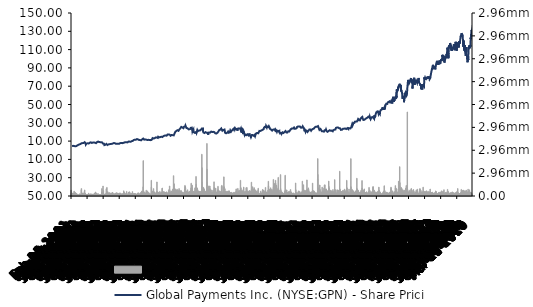
| Category | Global Payments Inc. (NYSE:GPN) - Volume |
|---|---|
| 2001-01-26 | 82000 |
| 2001-01-29 | 262000 |
| 2001-01-30 | 339200 |
| 2001-01-31 | 326000 |
| 2001-02-01 | 2556800 |
| 2001-02-02 | 795600 |
| 2001-02-05 | 644800 |
| 2001-02-06 | 1338800 |
| 2001-02-07 | 1350400 |
| 2001-02-08 | 578800 |
| 2001-02-09 | 441600 |
| 2001-02-12 | 327200 |
| 2001-02-13 | 648800 |
| 2001-02-14 | 135600 |
| 2001-02-15 | 454400 |
| 2001-02-16 | 427200 |
| 2001-02-20 | 1000400 |
| 2001-02-21 | 443600 |
| 2001-02-22 | 623600 |
| 2001-02-23 | 1222800 |
| 2001-02-26 | 1182400 |
| 2001-02-27 | 690000 |
| 2001-02-28 | 326000 |
| 2001-03-01 | 155200 |
| 2001-03-02 | 836800 |
| 2001-03-05 | 402800 |
| 2001-03-06 | 610000 |
| 2001-03-07 | 89600 |
| 2001-03-08 | 211600 |
| 2001-03-09 | 269600 |
| 2001-03-12 | 106400 |
| 2001-03-13 | 671600 |
| 2001-03-14 | 455600 |
| 2001-03-15 | 1160400 |
| 2001-03-16 | 402800 |
| 2001-03-19 | 1173600 |
| 2001-03-20 | 222000 |
| 2001-03-21 | 135200 |
| 2001-03-22 | 2125600 |
| 2001-03-23 | 757600 |
| 2001-03-26 | 207600 |
| 2001-03-27 | 435200 |
| 2001-03-28 | 420800 |
| 2001-03-29 | 535200 |
| 2001-03-30 | 1308800 |
| 2001-04-02 | 685600 |
| 2001-04-03 | 192800 |
| 2001-04-04 | 606000 |
| 2001-04-05 | 629200 |
| 2001-04-06 | 476000 |
| 2001-04-09 | 113600 |
| 2001-04-10 | 954400 |
| 2001-04-11 | 1570000 |
| 2001-04-12 | 689200 |
| 2001-04-16 | 368000 |
| 2001-04-17 | 581200 |
| 2001-04-18 | 285200 |
| 2001-04-19 | 121600 |
| 2001-04-20 | 1139600 |
| 2001-04-23 | 946400 |
| 2001-04-24 | 626000 |
| 2001-04-25 | 326000 |
| 2001-04-26 | 469200 |
| 2001-04-27 | 550800 |
| 2001-04-30 | 946800 |
| 2001-05-01 | 889200 |
| 2001-05-02 | 547600 |
| 2001-05-03 | 289200 |
| 2001-05-04 | 521600 |
| 2001-05-07 | 176400 |
| 2001-05-08 | 920000 |
| 2001-05-09 | 213200 |
| 2001-05-10 | 161600 |
| 2001-05-11 | 71600 |
| 2001-05-14 | 136400 |
| 2001-05-15 | 244800 |
| 2001-05-16 | 309600 |
| 2001-05-17 | 278800 |
| 2001-05-18 | 119600 |
| 2001-05-21 | 113600 |
| 2001-05-22 | 606800 |
| 2001-05-23 | 323200 |
| 2001-05-24 | 375200 |
| 2001-05-25 | 251600 |
| 2001-05-29 | 271200 |
| 2001-05-30 | 334000 |
| 2001-05-31 | 350400 |
| 2001-06-01 | 77200 |
| 2001-06-04 | 92800 |
| 2001-06-05 | 513600 |
| 2001-06-06 | 279200 |
| 2001-06-07 | 400000 |
| 2001-06-08 | 111600 |
| 2001-06-11 | 267200 |
| 2001-06-12 | 351600 |
| 2001-06-13 | 111600 |
| 2001-06-14 | 155600 |
| 2001-06-15 | 436000 |
| 2001-06-18 | 177600 |
| 2001-06-19 | 145200 |
| 2001-06-20 | 306400 |
| 2001-06-21 | 946400 |
| 2001-06-22 | 276800 |
| 2001-06-25 | 233600 |
| 2001-06-26 | 731200 |
| 2001-06-27 | 396400 |
| 2001-06-28 | 433600 |
| 2001-06-29 | 523200 |
| 2001-07-02 | 410000 |
| 2001-07-03 | 197200 |
| 2001-07-05 | 460400 |
| 2001-07-06 | 181200 |
| 2001-07-09 | 556400 |
| 2001-07-10 | 346800 |
| 2001-07-11 | 250800 |
| 2001-07-12 | 349600 |
| 2001-07-13 | 151200 |
| 2001-07-16 | 93200 |
| 2001-07-17 | 190000 |
| 2001-07-18 | 139200 |
| 2001-07-19 | 2679600 |
| 2001-07-20 | 3266800 |
| 2001-07-23 | 1524000 |
| 2001-07-24 | 934800 |
| 2001-07-25 | 184800 |
| 2001-07-26 | 294000 |
| 2001-07-27 | 732000 |
| 2001-07-30 | 501200 |
| 2001-07-31 | 347200 |
| 2001-08-01 | 368400 |
| 2001-08-02 | 421200 |
| 2001-08-03 | 507600 |
| 2001-08-06 | 564800 |
| 2001-08-07 | 190400 |
| 2001-08-08 | 264800 |
| 2001-08-09 | 348400 |
| 2001-08-10 | 366400 |
| 2001-08-13 | 1308000 |
| 2001-08-14 | 746000 |
| 2001-08-15 | 1166000 |
| 2001-08-16 | 306800 |
| 2001-08-17 | 667600 |
| 2001-08-20 | 315200 |
| 2001-08-21 | 638800 |
| 2001-08-22 | 309200 |
| 2001-08-23 | 356800 |
| 2001-08-24 | 189200 |
| 2001-08-27 | 161200 |
| 2001-08-28 | 242000 |
| 2001-08-29 | 306000 |
| 2001-08-30 | 229600 |
| 2001-08-31 | 451600 |
| 2001-09-04 | 513600 |
| 2001-09-05 | 286400 |
| 2001-09-06 | 1967200 |
| 2001-09-07 | 1041200 |
| 2001-09-10 | 315600 |
| 2001-09-17 | 782400 |
| 2001-09-18 | 2638400 |
| 2001-09-19 | 559600 |
| 2001-09-20 | 423600 |
| 2001-09-21 | 972000 |
| 2001-09-24 | 926400 |
| 2001-09-25 | 1120400 |
| 2001-09-26 | 1187600 |
| 2001-09-27 | 281600 |
| 2001-09-28 | 975600 |
| 2001-10-01 | 441200 |
| 2001-10-02 | 298400 |
| 2001-10-03 | 298000 |
| 2001-10-04 | 559200 |
| 2001-10-05 | 409200 |
| 2001-10-08 | 155200 |
| 2001-10-09 | 444400 |
| 2001-10-10 | 288000 |
| 2001-10-11 | 255200 |
| 2001-10-12 | 170400 |
| 2001-10-15 | 240800 |
| 2001-10-16 | 638800 |
| 2001-10-17 | 334000 |
| 2001-10-18 | 349600 |
| 2001-10-19 | 266800 |
| 2001-10-22 | 294800 |
| 2001-10-23 | 224400 |
| 2001-10-24 | 141600 |
| 2001-10-25 | 349600 |
| 2001-10-26 | 185200 |
| 2001-10-29 | 514000 |
| 2001-10-30 | 482400 |
| 2001-10-31 | 409200 |
| 2001-11-01 | 482000 |
| 2001-11-02 | 235200 |
| 2001-11-05 | 353600 |
| 2001-11-06 | 316800 |
| 2001-11-07 | 226400 |
| 2001-11-08 | 315600 |
| 2001-11-09 | 408400 |
| 2001-11-12 | 149200 |
| 2001-11-13 | 478400 |
| 2001-11-14 | 132800 |
| 2001-11-15 | 233600 |
| 2001-11-16 | 390800 |
| 2001-11-19 | 818000 |
| 2001-11-20 | 1246800 |
| 2001-11-21 | 261600 |
| 2001-11-23 | 232400 |
| 2001-11-26 | 735200 |
| 2001-11-27 | 364400 |
| 2001-11-28 | 364400 |
| 2001-11-29 | 284800 |
| 2001-11-30 | 615600 |
| 2001-12-03 | 518800 |
| 2001-12-04 | 513200 |
| 2001-12-05 | 633200 |
| 2001-12-06 | 385200 |
| 2001-12-07 | 426000 |
| 2001-12-10 | 789600 |
| 2001-12-11 | 571200 |
| 2001-12-12 | 290400 |
| 2001-12-13 | 366400 |
| 2001-12-14 | 476000 |
| 2001-12-17 | 581200 |
| 2001-12-18 | 821600 |
| 2001-12-19 | 614400 |
| 2001-12-20 | 366400 |
| 2001-12-21 | 932800 |
| 2001-12-24 | 76800 |
| 2001-12-26 | 328400 |
| 2001-12-27 | 609600 |
| 2001-12-28 | 439200 |
| 2001-12-31 | 327200 |
| 2002-01-02 | 439600 |
| 2002-01-03 | 582800 |
| 2002-01-04 | 672000 |
| 2002-01-07 | 330000 |
| 2002-01-08 | 318800 |
| 2002-01-09 | 304800 |
| 2002-01-10 | 904800 |
| 2002-01-11 | 272000 |
| 2002-01-14 | 222400 |
| 2002-01-15 | 203600 |
| 2002-01-16 | 337600 |
| 2002-01-17 | 503200 |
| 2002-01-18 | 336800 |
| 2002-01-22 | 227200 |
| 2002-01-23 | 337200 |
| 2002-01-24 | 282400 |
| 2002-01-25 | 310800 |
| 2002-01-28 | 338400 |
| 2002-01-29 | 825600 |
| 2002-01-30 | 470400 |
| 2002-01-31 | 602000 |
| 2002-02-01 | 534400 |
| 2002-02-04 | 392000 |
| 2002-02-05 | 181600 |
| 2002-02-06 | 301600 |
| 2002-02-07 | 318800 |
| 2002-02-08 | 315200 |
| 2002-02-11 | 361600 |
| 2002-02-12 | 376000 |
| 2002-02-13 | 806400 |
| 2002-02-14 | 242400 |
| 2002-02-15 | 738000 |
| 2002-02-19 | 412400 |
| 2002-02-20 | 525200 |
| 2002-02-21 | 324800 |
| 2002-02-22 | 466400 |
| 2002-02-25 | 435200 |
| 2002-02-26 | 142400 |
| 2002-02-27 | 377600 |
| 2002-02-28 | 1262000 |
| 2002-03-01 | 442800 |
| 2002-03-04 | 606000 |
| 2002-03-05 | 545600 |
| 2002-03-06 | 408400 |
| 2002-03-07 | 588800 |
| 2002-03-08 | 1193200 |
| 2002-03-11 | 718000 |
| 2002-03-12 | 404000 |
| 2002-03-13 | 210400 |
| 2002-03-14 | 222400 |
| 2002-03-15 | 414000 |
| 2002-03-18 | 1752000 |
| 2002-03-19 | 643200 |
| 2002-03-20 | 1170800 |
| 2002-03-21 | 1375600 |
| 2002-03-22 | 1010400 |
| 2002-03-25 | 538400 |
| 2002-03-26 | 622800 |
| 2002-03-27 | 474800 |
| 2002-03-28 | 435600 |
| 2002-04-01 | 359200 |
| 2002-04-02 | 332400 |
| 2002-04-03 | 273200 |
| 2002-04-04 | 1028800 |
| 2002-04-05 | 530000 |
| 2002-04-08 | 689200 |
| 2002-04-09 | 435200 |
| 2002-04-10 | 478400 |
| 2002-04-11 | 900000 |
| 2002-04-12 | 754400 |
| 2002-04-15 | 620400 |
| 2002-04-16 | 537600 |
| 2002-04-17 | 314800 |
| 2002-04-18 | 915200 |
| 2002-04-19 | 199600 |
| 2002-04-22 | 274800 |
| 2002-04-23 | 280800 |
| 2002-04-24 | 315200 |
| 2002-04-25 | 343600 |
| 2002-04-26 | 359200 |
| 2002-04-29 | 374000 |
| 2002-04-30 | 1017200 |
| 2002-05-01 | 481200 |
| 2002-05-02 | 360800 |
| 2002-05-03 | 533200 |
| 2002-05-06 | 272400 |
| 2002-05-07 | 300800 |
| 2002-05-08 | 431600 |
| 2002-05-09 | 518400 |
| 2002-05-10 | 284400 |
| 2002-05-13 | 276800 |
| 2002-05-14 | 458400 |
| 2002-05-15 | 403600 |
| 2002-05-16 | 260400 |
| 2002-05-17 | 335200 |
| 2002-05-20 | 420800 |
| 2002-05-21 | 490000 |
| 2002-05-22 | 528400 |
| 2002-05-23 | 446000 |
| 2002-05-24 | 311600 |
| 2002-05-28 | 219600 |
| 2002-05-29 | 276400 |
| 2002-05-30 | 340400 |
| 2002-05-31 | 457200 |
| 2002-06-03 | 592400 |
| 2002-06-04 | 649600 |
| 2002-06-05 | 618400 |
| 2002-06-06 | 615600 |
| 2002-06-07 | 508400 |
| 2002-06-10 | 332400 |
| 2002-06-11 | 243600 |
| 2002-06-12 | 512000 |
| 2002-06-13 | 424800 |
| 2002-06-14 | 466800 |
| 2002-06-17 | 512800 |
| 2002-06-18 | 396800 |
| 2002-06-19 | 484800 |
| 2002-06-20 | 353600 |
| 2002-06-21 | 748800 |
| 2002-06-24 | 852800 |
| 2002-06-25 | 1016000 |
| 2002-06-26 | 1466400 |
| 2002-06-27 | 1668400 |
| 2002-06-28 | 3239600 |
| 2002-07-01 | 996800 |
| 2002-07-02 | 726000 |
| 2002-07-03 | 312800 |
| 2002-07-05 | 115600 |
| 2002-07-08 | 423600 |
| 2002-07-09 | 955600 |
| 2002-07-10 | 522800 |
| 2002-07-11 | 791600 |
| 2002-07-12 | 535600 |
| 2002-07-15 | 779600 |
| 2002-07-16 | 677200 |
| 2002-07-17 | 937200 |
| 2002-07-18 | 4363600 |
| 2002-07-19 | 1128400 |
| 2002-07-22 | 1453200 |
| 2002-07-23 | 1330000 |
| 2002-07-24 | 740800 |
| 2002-07-25 | 2378400 |
| 2002-07-26 | 605600 |
| 2002-07-29 | 355600 |
| 2002-07-30 | 794000 |
| 2002-07-31 | 737200 |
| 2002-08-01 | 409600 |
| 2002-08-02 | 336800 |
| 2002-08-05 | 250000 |
| 2002-08-06 | 571600 |
| 2002-08-07 | 833200 |
| 2002-08-08 | 437200 |
| 2002-08-09 | 534800 |
| 2002-08-12 | 706000 |
| 2002-08-13 | 466800 |
| 2002-08-14 | 411200 |
| 2002-08-15 | 273200 |
| 2002-08-16 | 583600 |
| 2002-08-19 | 586800 |
| 2002-08-20 | 574400 |
| 2002-08-21 | 564400 |
| 2002-08-22 | 340000 |
| 2002-08-23 | 339200 |
| 2002-08-26 | 236000 |
| 2002-08-27 | 452800 |
| 2002-08-28 | 336400 |
| 2002-08-29 | 480400 |
| 2002-08-30 | 299200 |
| 2002-09-03 | 230800 |
| 2002-09-04 | 435200 |
| 2002-09-05 | 600400 |
| 2002-09-06 | 350800 |
| 2002-09-09 | 1310800 |
| 2002-09-10 | 3163200 |
| 2002-09-11 | 888000 |
| 2002-09-12 | 658400 |
| 2002-09-13 | 1352400 |
| 2002-09-16 | 1165200 |
| 2002-09-17 | 1048000 |
| 2002-09-18 | 608000 |
| 2002-09-19 | 3760400 |
| 2002-09-20 | 1194800 |
| 2002-09-23 | 822800 |
| 2002-09-24 | 674800 |
| 2002-09-25 | 437200 |
| 2002-09-26 | 576400 |
| 2002-09-27 | 800000 |
| 2002-09-30 | 670000 |
| 2002-10-01 | 1747200 |
| 2002-10-02 | 1017200 |
| 2002-10-03 | 1875200 |
| 2002-10-04 | 1268800 |
| 2002-10-07 | 623200 |
| 2002-10-08 | 790800 |
| 2002-10-09 | 475200 |
| 2002-10-10 | 775200 |
| 2002-10-11 | 676400 |
| 2002-10-14 | 398000 |
| 2002-10-15 | 783200 |
| 2002-10-16 | 1066000 |
| 2002-10-17 | 1315600 |
| 2002-10-18 | 527200 |
| 2002-10-21 | 453600 |
| 2002-10-22 | 496400 |
| 2002-10-23 | 700800 |
| 2002-10-24 | 530800 |
| 2002-10-25 | 310800 |
| 2002-10-28 | 194800 |
| 2002-10-29 | 1215600 |
| 2002-10-30 | 636800 |
| 2002-10-31 | 794000 |
| 2002-11-01 | 763200 |
| 2002-11-04 | 1488400 |
| 2002-11-05 | 410400 |
| 2002-11-06 | 746800 |
| 2002-11-07 | 352400 |
| 2002-11-08 | 540800 |
| 2002-11-11 | 634800 |
| 2002-11-12 | 667200 |
| 2002-11-13 | 1162000 |
| 2002-11-14 | 558400 |
| 2002-11-15 | 448800 |
| 2002-11-18 | 409200 |
| 2002-11-19 | 525600 |
| 2002-11-20 | 757600 |
| 2002-11-21 | 679200 |
| 2002-11-22 | 303600 |
| 2002-11-25 | 484000 |
| 2002-11-26 | 389200 |
| 2002-11-27 | 604800 |
| 2002-11-29 | 96000 |
| 2002-12-02 | 286000 |
| 2002-12-03 | 467600 |
| 2002-12-04 | 1338400 |
| 2002-12-05 | 354800 |
| 2002-12-06 | 476400 |
| 2002-12-09 | 424800 |
| 2002-12-10 | 740000 |
| 2002-12-11 | 274800 |
| 2002-12-12 | 817200 |
| 2002-12-13 | 530800 |
| 2002-12-16 | 523600 |
| 2002-12-17 | 357200 |
| 2002-12-18 | 923600 |
| 2002-12-19 | 1518000 |
| 2002-12-20 | 1540400 |
| 2002-12-23 | 706000 |
| 2002-12-24 | 262800 |
| 2002-12-26 | 313600 |
| 2002-12-27 | 301200 |
| 2002-12-30 | 630400 |
| 2002-12-31 | 653600 |
| 2003-01-02 | 1044000 |
| 2003-01-03 | 428800 |
| 2003-01-06 | 841600 |
| 2003-01-07 | 479600 |
| 2003-01-08 | 322000 |
| 2003-01-09 | 501600 |
| 2003-01-10 | 667200 |
| 2003-01-13 | 466800 |
| 2003-01-14 | 374400 |
| 2003-01-15 | 542400 |
| 2003-01-16 | 407200 |
| 2003-01-17 | 370800 |
| 2003-01-21 | 306400 |
| 2003-01-22 | 544000 |
| 2003-01-23 | 1068000 |
| 2003-01-24 | 505200 |
| 2003-01-27 | 602800 |
| 2003-01-28 | 631600 |
| 2003-01-29 | 638400 |
| 2003-01-30 | 311200 |
| 2003-01-31 | 449200 |
| 2003-02-03 | 280800 |
| 2003-02-04 | 698800 |
| 2003-02-05 | 550800 |
| 2003-02-06 | 388000 |
| 2003-02-07 | 400800 |
| 2003-02-10 | 413600 |
| 2003-02-11 | 485200 |
| 2003-02-12 | 480800 |
| 2003-02-13 | 1259200 |
| 2003-02-14 | 710400 |
| 2003-02-18 | 224000 |
| 2003-02-19 | 286800 |
| 2003-02-20 | 282000 |
| 2003-02-21 | 226800 |
| 2003-02-24 | 384000 |
| 2003-02-25 | 800000 |
| 2003-02-26 | 281200 |
| 2003-02-27 | 1477200 |
| 2003-02-28 | 333600 |
| 2003-03-03 | 746000 |
| 2003-03-04 | 287200 |
| 2003-03-05 | 273600 |
| 2003-03-06 | 264000 |
| 2003-03-07 | 624000 |
| 2003-03-10 | 586800 |
| 2003-03-11 | 227600 |
| 2003-03-12 | 846800 |
| 2003-03-13 | 634800 |
| 2003-03-14 | 379200 |
| 2003-03-17 | 1266000 |
| 2003-03-18 | 1115600 |
| 2003-03-19 | 283600 |
| 2003-03-20 | 1016000 |
| 2003-03-21 | 1146000 |
| 2003-03-24 | 528000 |
| 2003-03-25 | 410000 |
| 2003-03-26 | 1011200 |
| 2003-03-27 | 374800 |
| 2003-03-28 | 490000 |
| 2003-03-31 | 504800 |
| 2003-04-01 | 714800 |
| 2003-04-02 | 646000 |
| 2003-04-03 | 540400 |
| 2003-04-04 | 410400 |
| 2003-04-07 | 646000 |
| 2003-04-08 | 443200 |
| 2003-04-09 | 533200 |
| 2003-04-10 | 911200 |
| 2003-04-11 | 690000 |
| 2003-04-14 | 715200 |
| 2003-04-15 | 1262000 |
| 2003-04-16 | 813200 |
| 2003-04-17 | 366000 |
| 2003-04-21 | 624800 |
| 2003-04-22 | 698000 |
| 2003-04-23 | 592000 |
| 2003-04-24 | 472400 |
| 2003-04-25 | 1356000 |
| 2003-04-28 | 503200 |
| 2003-04-29 | 642800 |
| 2003-04-30 | 508000 |
| 2003-05-01 | 865600 |
| 2003-05-02 | 960000 |
| 2003-05-05 | 576000 |
| 2003-05-06 | 498000 |
| 2003-05-07 | 582000 |
| 2003-05-08 | 636000 |
| 2003-05-09 | 312400 |
| 2003-05-12 | 830800 |
| 2003-05-13 | 321600 |
| 2003-05-14 | 231200 |
| 2003-05-15 | 363200 |
| 2003-05-16 | 666800 |
| 2003-05-19 | 448000 |
| 2003-05-20 | 412800 |
| 2003-05-21 | 404000 |
| 2003-05-22 | 475600 |
| 2003-05-23 | 121600 |
| 2003-05-27 | 982400 |
| 2003-05-28 | 304000 |
| 2003-05-29 | 755600 |
| 2003-05-30 | 1051200 |
| 2003-06-02 | 596000 |
| 2003-06-03 | 481600 |
| 2003-06-04 | 254400 |
| 2003-06-05 | 462800 |
| 2003-06-06 | 725600 |
| 2003-06-09 | 361600 |
| 2003-06-10 | 324000 |
| 2003-06-11 | 175200 |
| 2003-06-12 | 256400 |
| 2003-06-13 | 334800 |
| 2003-06-16 | 373600 |
| 2003-06-17 | 352000 |
| 2003-06-18 | 252000 |
| 2003-06-19 | 357200 |
| 2003-06-20 | 325200 |
| 2003-06-23 | 1045200 |
| 2003-06-24 | 696800 |
| 2003-06-25 | 2260400 |
| 2003-06-26 | 651600 |
| 2003-06-27 | 699200 |
| 2003-06-30 | 1491600 |
| 2003-07-01 | 744800 |
| 2003-07-02 | 706400 |
| 2003-07-03 | 409600 |
| 2003-07-07 | 552000 |
| 2003-07-08 | 1586800 |
| 2003-07-09 | 398000 |
| 2003-07-10 | 256000 |
| 2003-07-11 | 409200 |
| 2003-07-14 | 647600 |
| 2003-07-15 | 722000 |
| 2003-07-16 | 1041200 |
| 2003-07-17 | 546800 |
| 2003-07-18 | 1064800 |
| 2003-07-21 | 397200 |
| 2003-07-22 | 446000 |
| 2003-07-23 | 296400 |
| 2003-07-24 | 275200 |
| 2003-07-25 | 318000 |
| 2003-07-28 | 245600 |
| 2003-07-29 | 281600 |
| 2003-07-30 | 393600 |
| 2003-07-31 | 261600 |
| 2003-08-01 | 333200 |
| 2003-08-04 | 345600 |
| 2003-08-05 | 475200 |
| 2003-08-06 | 182400 |
| 2003-08-07 | 153600 |
| 2003-08-08 | 212400 |
| 2003-08-11 | 203200 |
| 2003-08-12 | 2005600 |
| 2003-08-13 | 1357200 |
| 2003-08-14 | 584000 |
| 2003-08-15 | 596000 |
| 2003-08-18 | 427200 |
| 2003-08-19 | 448400 |
| 2003-08-20 | 424400 |
| 2003-08-21 | 324000 |
| 2003-08-22 | 300800 |
| 2003-08-25 | 134000 |
| 2003-08-26 | 294000 |
| 2003-08-27 | 130400 |
| 2003-08-28 | 254400 |
| 2003-08-29 | 262000 |
| 2003-09-02 | 485200 |
| 2003-09-03 | 303600 |
| 2003-09-04 | 360800 |
| 2003-09-05 | 474400 |
| 2003-09-08 | 880400 |
| 2003-09-09 | 813600 |
| 2003-09-10 | 1025200 |
| 2003-09-11 | 1328400 |
| 2003-09-12 | 856800 |
| 2003-09-15 | 372800 |
| 2003-09-16 | 783600 |
| 2003-09-17 | 1488000 |
| 2003-09-18 | 1647600 |
| 2003-09-19 | 619600 |
| 2003-09-22 | 591600 |
| 2003-09-23 | 902800 |
| 2003-09-24 | 1244000 |
| 2003-09-25 | 1846400 |
| 2003-09-26 | 952000 |
| 2003-09-29 | 1072800 |
| 2003-09-30 | 792400 |
| 2003-10-01 | 1611200 |
| 2003-10-02 | 1391200 |
| 2003-10-03 | 548800 |
| 2003-10-06 | 800400 |
| 2003-10-07 | 486800 |
| 2003-10-08 | 491200 |
| 2003-10-09 | 671600 |
| 2003-10-10 | 253200 |
| 2003-10-13 | 273200 |
| 2003-10-14 | 492800 |
| 2003-10-15 | 452000 |
| 2003-10-16 | 505200 |
| 2003-10-17 | 802800 |
| 2003-10-20 | 538000 |
| 2003-10-21 | 514400 |
| 2003-10-22 | 664000 |
| 2003-10-23 | 1059200 |
| 2003-10-24 | 1073200 |
| 2003-10-27 | 491200 |
| 2003-10-28 | 654800 |
| 2003-10-29 | 743200 |
| 2003-10-30 | 746000 |
| 2003-10-31 | 648800 |
| 2003-11-03 | 621584 |
| 2003-11-04 | 502320 |
| 2003-11-05 | 474400 |
| 2003-11-06 | 682400 |
| 2003-11-07 | 344400 |
| 2003-11-10 | 641600 |
| 2003-11-11 | 287600 |
| 2003-11-12 | 517200 |
| 2003-11-13 | 1940000 |
| 2003-11-14 | 1002800 |
| 2003-11-17 | 609600 |
| 2003-11-18 | 440800 |
| 2003-11-19 | 1303600 |
| 2003-11-20 | 1207600 |
| 2003-11-21 | 424800 |
| 2003-11-24 | 648000 |
| 2003-11-25 | 555200 |
| 2003-11-26 | 480400 |
| 2003-11-28 | 325600 |
| 2003-12-01 | 358000 |
| 2003-12-02 | 670000 |
| 2003-12-03 | 488400 |
| 2003-12-04 | 636400 |
| 2003-12-05 | 340000 |
| 2003-12-08 | 342400 |
| 2003-12-09 | 612800 |
| 2003-12-10 | 627600 |
| 2003-12-11 | 753200 |
| 2003-12-12 | 1082800 |
| 2003-12-15 | 603200 |
| 2003-12-16 | 712000 |
| 2003-12-17 | 762800 |
| 2003-12-18 | 527200 |
| 2003-12-19 | 822400 |
| 2003-12-22 | 858000 |
| 2003-12-23 | 999200 |
| 2003-12-24 | 166000 |
| 2003-12-26 | 162000 |
| 2003-12-29 | 667200 |
| 2003-12-30 | 676400 |
| 2003-12-31 | 343200 |
| 2004-01-02 | 988800 |
| 2004-01-05 | 806000 |
| 2004-01-06 | 974800 |
| 2004-01-07 | 352000 |
| 2004-01-08 | 274800 |
| 2004-01-09 | 573200 |
| 2004-01-12 | 562000 |
| 2004-01-13 | 457600 |
| 2004-01-14 | 706000 |
| 2004-01-15 | 500000 |
| 2004-01-16 | 540800 |
| 2004-01-20 | 785600 |
| 2004-01-21 | 702000 |
| 2004-01-22 | 671200 |
| 2004-01-23 | 413200 |
| 2004-01-26 | 311600 |
| 2004-01-27 | 376400 |
| 2004-01-28 | 494800 |
| 2004-01-29 | 848400 |
| 2004-01-30 | 743600 |
| 2004-02-02 | 746400 |
| 2004-02-03 | 665600 |
| 2004-02-04 | 679600 |
| 2004-02-05 | 561600 |
| 2004-02-06 | 463200 |
| 2004-02-09 | 674000 |
| 2004-02-10 | 591200 |
| 2004-02-11 | 1275200 |
| 2004-02-12 | 874000 |
| 2004-02-13 | 739200 |
| 2004-02-17 | 1178400 |
| 2004-02-18 | 876400 |
| 2004-02-19 | 816400 |
| 2004-02-20 | 1288000 |
| 2004-02-23 | 1356800 |
| 2004-02-24 | 778400 |
| 2004-02-25 | 420000 |
| 2004-02-26 | 743200 |
| 2004-02-27 | 617600 |
| 2004-03-01 | 699600 |
| 2004-03-02 | 695600 |
| 2004-03-03 | 542800 |
| 2004-03-04 | 558800 |
| 2004-03-05 | 489200 |
| 2004-03-08 | 644000 |
| 2004-03-09 | 408800 |
| 2004-03-10 | 378800 |
| 2004-03-11 | 533200 |
| 2004-03-12 | 383600 |
| 2004-03-15 | 531200 |
| 2004-03-16 | 721200 |
| 2004-03-17 | 461200 |
| 2004-03-18 | 1183600 |
| 2004-03-19 | 586000 |
| 2004-03-22 | 616000 |
| 2004-03-23 | 582000 |
| 2004-03-24 | 993600 |
| 2004-03-25 | 711600 |
| 2004-03-26 | 388400 |
| 2004-03-29 | 360400 |
| 2004-03-30 | 632000 |
| 2004-03-31 | 938400 |
| 2004-04-01 | 795200 |
| 2004-04-02 | 1511200 |
| 2004-04-05 | 668800 |
| 2004-04-06 | 378800 |
| 2004-04-07 | 752800 |
| 2004-04-08 | 773200 |
| 2004-04-12 | 458400 |
| 2004-04-13 | 1560800 |
| 2004-04-14 | 854400 |
| 2004-04-15 | 1852400 |
| 2004-04-16 | 1755200 |
| 2004-04-19 | 2155600 |
| 2004-04-20 | 1188000 |
| 2004-04-21 | 568400 |
| 2004-04-22 | 1177600 |
| 2004-04-23 | 919200 |
| 2004-04-26 | 696000 |
| 2004-04-27 | 680800 |
| 2004-04-28 | 470000 |
| 2004-04-29 | 662400 |
| 2004-04-30 | 487600 |
| 2004-05-03 | 613200 |
| 2004-05-04 | 800000 |
| 2004-05-05 | 2048000 |
| 2004-05-06 | 1278000 |
| 2004-05-07 | 1456800 |
| 2004-05-10 | 996800 |
| 2004-05-11 | 4020000 |
| 2004-05-12 | 15467200 |
| 2004-05-13 | 2550800 |
| 2004-05-14 | 2379600 |
| 2004-05-17 | 1096400 |
| 2004-05-18 | 1387200 |
| 2004-05-19 | 2032800 |
| 2004-05-20 | 840400 |
| 2004-05-21 | 944000 |
| 2004-05-24 | 717200 |
| 2004-05-25 | 853600 |
| 2004-05-26 | 1147600 |
| 2004-05-27 | 548400 |
| 2004-05-28 | 370800 |
| 2004-06-01 | 694000 |
| 2004-06-02 | 710000 |
| 2004-06-03 | 1614000 |
| 2004-06-04 | 428000 |
| 2004-06-07 | 604800 |
| 2004-06-08 | 511200 |
| 2004-06-09 | 842400 |
| 2004-06-10 | 612000 |
| 2004-06-14 | 916800 |
| 2004-06-15 | 742400 |
| 2004-06-16 | 762000 |
| 2004-06-17 | 367200 |
| 2004-06-18 | 389600 |
| 2004-06-21 | 711200 |
| 2004-06-22 | 1080400 |
| 2004-06-23 | 908400 |
| 2004-06-24 | 1238400 |
| 2004-06-25 | 1194800 |
| 2004-06-28 | 624800 |
| 2004-06-29 | 1141600 |
| 2004-06-30 | 1207200 |
| 2004-07-01 | 2515200 |
| 2004-07-02 | 945600 |
| 2004-07-06 | 1128800 |
| 2004-07-07 | 1592800 |
| 2004-07-08 | 1594800 |
| 2004-07-09 | 1134800 |
| 2004-07-12 | 1017200 |
| 2004-07-13 | 934800 |
| 2004-07-14 | 1037200 |
| 2004-07-15 | 752800 |
| 2004-07-16 | 1337200 |
| 2004-07-19 | 1712400 |
| 2004-07-20 | 794000 |
| 2004-07-21 | 1534000 |
| 2004-07-22 | 2222800 |
| 2004-07-23 | 1085200 |
| 2004-07-26 | 1012400 |
| 2004-07-27 | 1188800 |
| 2004-07-28 | 488400 |
| 2004-07-29 | 598000 |
| 2004-07-30 | 623600 |
| 2004-08-02 | 626000 |
| 2004-08-03 | 753600 |
| 2004-08-04 | 858000 |
| 2004-08-05 | 545200 |
| 2004-08-06 | 1085600 |
| 2004-08-09 | 555200 |
| 2004-08-10 | 668800 |
| 2004-08-11 | 1603600 |
| 2004-08-12 | 1161200 |
| 2004-08-13 | 1048000 |
| 2004-08-16 | 376800 |
| 2004-08-17 | 584400 |
| 2004-08-18 | 811600 |
| 2004-08-19 | 903600 |
| 2004-08-20 | 452800 |
| 2004-08-23 | 623600 |
| 2004-08-24 | 505200 |
| 2004-08-25 | 598800 |
| 2004-08-26 | 499200 |
| 2004-08-27 | 456800 |
| 2004-08-30 | 424800 |
| 2004-08-31 | 903200 |
| 2004-09-01 | 662800 |
| 2004-09-02 | 739200 |
| 2004-09-03 | 497600 |
| 2004-09-07 | 517200 |
| 2004-09-08 | 524400 |
| 2004-09-09 | 672000 |
| 2004-09-10 | 355200 |
| 2004-09-13 | 340400 |
| 2004-09-14 | 526400 |
| 2004-09-15 | 582000 |
| 2004-09-16 | 281200 |
| 2004-09-17 | 343200 |
| 2004-09-20 | 425600 |
| 2004-09-21 | 854400 |
| 2004-09-22 | 934000 |
| 2004-09-23 | 6858400 |
| 2004-09-24 | 3878000 |
| 2004-09-27 | 1092800 |
| 2004-09-28 | 1106000 |
| 2004-09-29 | 1455600 |
| 2004-09-30 | 1502000 |
| 2004-10-01 | 1899600 |
| 2004-10-04 | 1332000 |
| 2004-10-05 | 850400 |
| 2004-10-06 | 689600 |
| 2004-10-07 | 754400 |
| 2004-10-08 | 845600 |
| 2004-10-11 | 1076400 |
| 2004-10-12 | 1371200 |
| 2004-10-13 | 2194000 |
| 2004-10-14 | 1449600 |
| 2004-10-15 | 992800 |
| 2004-10-18 | 1194400 |
| 2004-10-19 | 1498800 |
| 2004-10-20 | 664400 |
| 2004-10-21 | 1792000 |
| 2004-10-22 | 1458000 |
| 2004-10-25 | 1008000 |
| 2004-10-26 | 922000 |
| 2004-10-27 | 1612000 |
| 2004-10-28 | 3244400 |
| 2004-10-29 | 994800 |
| 2004-11-01 | 1645600 |
| 2004-11-02 | 1892400 |
| 2004-11-03 | 1679600 |
| 2004-11-04 | 1052000 |
| 2004-11-05 | 964000 |
| 2004-11-08 | 1243600 |
| 2004-11-09 | 1049600 |
| 2004-11-10 | 1282400 |
| 2004-11-11 | 559600 |
| 2004-11-12 | 897200 |
| 2004-11-15 | 1212000 |
| 2004-11-16 | 576400 |
| 2004-11-17 | 1777600 |
| 2004-11-18 | 712800 |
| 2004-11-19 | 564800 |
| 2004-11-22 | 831200 |
| 2004-11-23 | 780400 |
| 2004-11-24 | 556000 |
| 2004-11-26 | 177200 |
| 2004-11-29 | 830800 |
| 2004-11-30 | 1040800 |
| 2004-12-01 | 715200 |
| 2004-12-02 | 630800 |
| 2004-12-03 | 830000 |
| 2004-12-06 | 830400 |
| 2004-12-07 | 754800 |
| 2004-12-08 | 576000 |
| 2004-12-09 | 565200 |
| 2004-12-10 | 456800 |
| 2004-12-13 | 890000 |
| 2004-12-14 | 584400 |
| 2004-12-15 | 742400 |
| 2004-12-16 | 1693600 |
| 2004-12-17 | 1496000 |
| 2004-12-20 | 662400 |
| 2004-12-21 | 1062000 |
| 2004-12-22 | 1733200 |
| 2004-12-23 | 6143200 |
| 2004-12-27 | 2107600 |
| 2004-12-28 | 1097600 |
| 2004-12-29 | 903600 |
| 2004-12-30 | 576800 |
| 2004-12-31 | 1107600 |
| 2005-01-03 | 1226400 |
| 2005-01-04 | 1289600 |
| 2005-01-05 | 1205600 |
| 2005-01-06 | 1575600 |
| 2005-01-07 | 1587600 |
| 2005-01-10 | 741600 |
| 2005-01-11 | 1088800 |
| 2005-01-12 | 1209200 |
| 2005-01-13 | 1632800 |
| 2005-01-14 | 470400 |
| 2005-01-18 | 609600 |
| 2005-01-19 | 559600 |
| 2005-01-20 | 886400 |
| 2005-01-21 | 598400 |
| 2005-01-24 | 862000 |
| 2005-01-25 | 658800 |
| 2005-01-26 | 680000 |
| 2005-01-27 | 1440800 |
| 2005-01-28 | 759600 |
| 2005-01-31 | 889600 |
| 2005-02-01 | 606000 |
| 2005-02-02 | 594000 |
| 2005-02-03 | 712400 |
| 2005-02-04 | 934400 |
| 2005-02-07 | 756800 |
| 2005-02-08 | 779600 |
| 2005-02-09 | 962800 |
| 2005-02-10 | 2004400 |
| 2005-02-11 | 614800 |
| 2005-02-14 | 669600 |
| 2005-02-15 | 452000 |
| 2005-02-16 | 1291600 |
| 2005-02-17 | 758800 |
| 2005-02-18 | 1414800 |
| 2005-02-22 | 968000 |
| 2005-02-23 | 780000 |
| 2005-02-24 | 528800 |
| 2005-02-25 | 738000 |
| 2005-02-28 | 655200 |
| 2005-03-01 | 1091200 |
| 2005-03-02 | 362400 |
| 2005-03-03 | 552800 |
| 2005-03-04 | 529600 |
| 2005-03-07 | 382400 |
| 2005-03-08 | 332800 |
| 2005-03-09 | 266800 |
| 2005-03-10 | 489200 |
| 2005-03-11 | 546800 |
| 2005-03-14 | 362000 |
| 2005-03-15 | 1746800 |
| 2005-03-16 | 820800 |
| 2005-03-17 | 666800 |
| 2005-03-18 | 626000 |
| 2005-03-21 | 807200 |
| 2005-03-22 | 3492000 |
| 2005-03-23 | 3228400 |
| 2005-03-24 | 1778000 |
| 2005-03-28 | 1471600 |
| 2005-03-29 | 1010000 |
| 2005-03-30 | 1464800 |
| 2005-03-31 | 1528000 |
| 2005-04-01 | 2121200 |
| 2005-04-04 | 1361600 |
| 2005-04-05 | 982400 |
| 2005-04-06 | 752400 |
| 2005-04-07 | 744400 |
| 2005-04-08 | 977200 |
| 2005-04-11 | 848000 |
| 2005-04-12 | 1118800 |
| 2005-04-13 | 1735200 |
| 2005-04-14 | 1148400 |
| 2005-04-15 | 1067600 |
| 2005-04-18 | 1384000 |
| 2005-04-19 | 1880000 |
| 2005-04-20 | 1191200 |
| 2005-04-21 | 1702000 |
| 2005-04-22 | 1401200 |
| 2005-04-25 | 1315200 |
| 2005-04-26 | 1112400 |
| 2005-04-27 | 1108800 |
| 2005-04-28 | 1445600 |
| 2005-04-29 | 1120800 |
| 2005-05-02 | 1719200 |
| 2005-05-03 | 1628800 |
| 2005-05-04 | 1441200 |
| 2005-05-05 | 949200 |
| 2005-05-06 | 655200 |
| 2005-05-09 | 734400 |
| 2005-05-10 | 1571600 |
| 2005-05-11 | 837600 |
| 2005-05-12 | 1448000 |
| 2005-05-13 | 624800 |
| 2005-05-16 | 723200 |
| 2005-05-17 | 1037600 |
| 2005-05-18 | 601200 |
| 2005-05-19 | 627200 |
| 2005-05-20 | 994000 |
| 2005-05-23 | 1048800 |
| 2005-05-24 | 1240000 |
| 2005-05-25 | 1290800 |
| 2005-05-26 | 857600 |
| 2005-05-27 | 818400 |
| 2005-05-31 | 1428400 |
| 2005-06-01 | 1268800 |
| 2005-06-02 | 711600 |
| 2005-06-03 | 1845600 |
| 2005-06-06 | 634800 |
| 2005-06-07 | 474400 |
| 2005-06-08 | 661600 |
| 2005-06-09 | 513200 |
| 2005-06-10 | 562000 |
| 2005-06-13 | 610800 |
| 2005-06-14 | 932800 |
| 2005-06-15 | 853600 |
| 2005-06-16 | 750000 |
| 2005-06-17 | 536800 |
| 2005-06-20 | 555200 |
| 2005-06-21 | 543200 |
| 2005-06-22 | 655200 |
| 2005-06-23 | 585600 |
| 2005-06-24 | 808000 |
| 2005-06-27 | 683200 |
| 2005-06-28 | 1598000 |
| 2005-06-29 | 1572000 |
| 2005-06-30 | 1271200 |
| 2005-07-01 | 944000 |
| 2005-07-05 | 1024000 |
| 2005-07-06 | 732400 |
| 2005-07-07 | 2298800 |
| 2005-07-08 | 2071200 |
| 2005-07-11 | 1603600 |
| 2005-07-12 | 2449200 |
| 2005-07-13 | 2830400 |
| 2005-07-14 | 1676800 |
| 2005-07-15 | 1659200 |
| 2005-07-18 | 1180800 |
| 2005-07-19 | 2025600 |
| 2005-07-20 | 1904400 |
| 2005-07-21 | 4366400 |
| 2005-07-22 | 2756400 |
| 2005-07-25 | 1862400 |
| 2005-07-26 | 2236000 |
| 2005-07-27 | 1397200 |
| 2005-07-28 | 1203200 |
| 2005-07-29 | 698000 |
| 2005-08-01 | 719200 |
| 2005-08-02 | 1040000 |
| 2005-08-03 | 1209600 |
| 2005-08-04 | 1502400 |
| 2005-08-05 | 956000 |
| 2005-08-08 | 532000 |
| 2005-08-09 | 909200 |
| 2005-08-10 | 827200 |
| 2005-08-11 | 390000 |
| 2005-08-12 | 459200 |
| 2005-08-15 | 552000 |
| 2005-08-16 | 577600 |
| 2005-08-17 | 619600 |
| 2005-08-18 | 784000 |
| 2005-08-19 | 542800 |
| 2005-08-22 | 716400 |
| 2005-08-23 | 734800 |
| 2005-08-24 | 2206400 |
| 2005-08-25 | 848400 |
| 2005-08-26 | 561200 |
| 2005-08-29 | 694000 |
| 2005-08-30 | 307200 |
| 2005-08-31 | 1381200 |
| 2005-09-01 | 995600 |
| 2005-09-02 | 367600 |
| 2005-09-06 | 410400 |
| 2005-09-07 | 670000 |
| 2005-09-08 | 866000 |
| 2005-09-09 | 2955600 |
| 2005-09-12 | 1811600 |
| 2005-09-13 | 792800 |
| 2005-09-14 | 592400 |
| 2005-09-15 | 1046800 |
| 2005-09-16 | 957600 |
| 2005-09-19 | 701200 |
| 2005-09-20 | 1320400 |
| 2005-09-21 | 1165600 |
| 2005-09-22 | 1220800 |
| 2005-09-23 | 8882000 |
| 2005-09-26 | 3562000 |
| 2005-09-27 | 2546800 |
| 2005-09-28 | 1398000 |
| 2005-09-29 | 3120800 |
| 2005-09-30 | 1376800 |
| 2005-10-03 | 2905200 |
| 2005-10-04 | 5318800 |
| 2005-10-05 | 1797600 |
| 2005-10-06 | 3156000 |
| 2005-10-07 | 2083600 |
| 2005-10-10 | 2634000 |
| 2005-10-11 | 2600400 |
| 2005-10-12 | 3344400 |
| 2005-10-13 | 1706000 |
| 2005-10-14 | 2475200 |
| 2005-10-17 | 1302400 |
| 2005-10-18 | 2482400 |
| 2005-10-19 | 2007200 |
| 2005-10-20 | 2987600 |
| 2005-10-21 | 1590800 |
| 2005-10-24 | 1859600 |
| 2005-10-25 | 1485600 |
| 2005-10-26 | 1606400 |
| 2005-10-27 | 1487200 |
| 2005-10-28 | 1736400 |
| 2005-10-31 | 2370400 |
| 2005-11-01 | 2539400 |
| 2005-11-02 | 1412200 |
| 2005-11-03 | 1611600 |
| 2005-11-04 | 1482400 |
| 2005-11-07 | 1244200 |
| 2005-11-08 | 1318200 |
| 2005-11-09 | 2340400 |
| 2005-11-10 | 1902400 |
| 2005-11-11 | 1303400 |
| 2005-11-14 | 1080600 |
| 2005-11-15 | 1384200 |
| 2005-11-16 | 433400 |
| 2005-11-17 | 1997600 |
| 2005-11-18 | 2991200 |
| 2005-11-21 | 2517800 |
| 2005-11-22 | 1374000 |
| 2005-11-23 | 1084800 |
| 2005-11-25 | 247000 |
| 2005-11-28 | 996800 |
| 2005-11-29 | 1036000 |
| 2005-11-30 | 1601000 |
| 2005-12-01 | 1438200 |
| 2005-12-02 | 851200 |
| 2005-12-05 | 1086600 |
| 2005-12-06 | 1075600 |
| 2005-12-07 | 708200 |
| 2005-12-08 | 2115800 |
| 2005-12-09 | 917400 |
| 2005-12-12 | 2304200 |
| 2005-12-13 | 921600 |
| 2005-12-14 | 517200 |
| 2005-12-15 | 1019600 |
| 2005-12-16 | 880000 |
| 2005-12-19 | 1283000 |
| 2005-12-20 | 1132600 |
| 2005-12-21 | 1110600 |
| 2005-12-22 | 3247800 |
| 2005-12-23 | 2447200 |
| 2005-12-27 | 1420800 |
| 2005-12-28 | 883600 |
| 2005-12-29 | 816200 |
| 2005-12-30 | 660200 |
| 2006-01-03 | 2042800 |
| 2006-01-04 | 1918000 |
| 2006-01-05 | 1534200 |
| 2006-01-06 | 1788400 |
| 2006-01-09 | 1312800 |
| 2006-01-10 | 1820400 |
| 2006-01-11 | 1260800 |
| 2006-01-12 | 1199200 |
| 2006-01-13 | 909800 |
| 2006-01-17 | 1317800 |
| 2006-01-18 | 763000 |
| 2006-01-19 | 1408400 |
| 2006-01-20 | 841600 |
| 2006-01-23 | 1676800 |
| 2006-01-24 | 2241000 |
| 2006-01-25 | 1482200 |
| 2006-01-26 | 2435800 |
| 2006-01-27 | 1182800 |
| 2006-01-30 | 2038200 |
| 2006-01-31 | 815200 |
| 2006-02-01 | 1174400 |
| 2006-02-02 | 802400 |
| 2006-02-03 | 735800 |
| 2006-02-06 | 1728400 |
| 2006-02-07 | 1056600 |
| 2006-02-08 | 1065400 |
| 2006-02-09 | 603800 |
| 2006-02-10 | 850800 |
| 2006-02-13 | 507000 |
| 2006-02-14 | 1723800 |
| 2006-02-15 | 1056400 |
| 2006-02-16 | 945800 |
| 2006-02-17 | 1311200 |
| 2006-02-21 | 1290400 |
| 2006-02-22 | 1644600 |
| 2006-02-23 | 998600 |
| 2006-02-24 | 807800 |
| 2006-02-27 | 1118200 |
| 2006-02-28 | 1569200 |
| 2006-03-01 | 1082000 |
| 2006-03-02 | 995200 |
| 2006-03-03 | 948800 |
| 2006-03-06 | 723600 |
| 2006-03-07 | 756400 |
| 2006-03-08 | 949000 |
| 2006-03-09 | 524800 |
| 2006-03-10 | 643600 |
| 2006-03-13 | 1100400 |
| 2006-03-14 | 1123000 |
| 2006-03-15 | 1423800 |
| 2006-03-16 | 1432400 |
| 2006-03-17 | 956600 |
| 2006-03-20 | 1201600 |
| 2006-03-21 | 1081400 |
| 2006-03-22 | 910000 |
| 2006-03-23 | 771400 |
| 2006-03-24 | 1169200 |
| 2006-03-27 | 2351000 |
| 2006-03-28 | 2673200 |
| 2006-03-29 | 3039000 |
| 2006-03-30 | 1637800 |
| 2006-03-31 | 4628400 |
| 2006-04-03 | 2613000 |
| 2006-04-04 | 1792200 |
| 2006-04-05 | 4125000 |
| 2006-04-06 | 1761000 |
| 2006-04-07 | 1402200 |
| 2006-04-10 | 3616000 |
| 2006-04-11 | 1622600 |
| 2006-04-12 | 1731600 |
| 2006-04-13 | 1857800 |
| 2006-04-17 | 918200 |
| 2006-04-18 | 1895400 |
| 2006-04-19 | 2270400 |
| 2006-04-20 | 2030600 |
| 2006-04-21 | 1075800 |
| 2006-04-24 | 995800 |
| 2006-04-25 | 766000 |
| 2006-04-26 | 908200 |
| 2006-04-27 | 887400 |
| 2006-04-28 | 789600 |
| 2006-05-01 | 880400 |
| 2006-05-02 | 743200 |
| 2006-05-03 | 716200 |
| 2006-05-04 | 1338800 |
| 2006-05-05 | 944000 |
| 2006-05-08 | 1133200 |
| 2006-05-09 | 1090000 |
| 2006-05-10 | 1106200 |
| 2006-05-11 | 1384800 |
| 2006-05-12 | 868000 |
| 2006-05-15 | 2717000 |
| 2006-05-16 | 1782800 |
| 2006-05-17 | 1585000 |
| 2006-05-18 | 902200 |
| 2006-05-19 | 1269000 |
| 2006-05-22 | 1597000 |
| 2006-05-23 | 928200 |
| 2006-05-24 | 1770400 |
| 2006-05-25 | 739600 |
| 2006-05-26 | 495400 |
| 2006-05-30 | 743800 |
| 2006-05-31 | 1276200 |
| 2006-06-01 | 887600 |
| 2006-06-02 | 1169200 |
| 2006-06-05 | 1043400 |
| 2006-06-06 | 756400 |
| 2006-06-07 | 750400 |
| 2006-06-08 | 1226000 |
| 2006-06-09 | 1119400 |
| 2006-06-12 | 1333400 |
| 2006-06-13 | 1424800 |
| 2006-06-14 | 1835600 |
| 2006-06-15 | 2088800 |
| 2006-06-16 | 1828800 |
| 2006-06-19 | 888600 |
| 2006-06-20 | 979800 |
| 2006-06-21 | 1086200 |
| 2006-06-22 | 751200 |
| 2006-06-23 | 790400 |
| 2006-06-26 | 627600 |
| 2006-06-27 | 541200 |
| 2006-06-28 | 1637200 |
| 2006-06-29 | 1254800 |
| 2006-06-30 | 1099400 |
| 2006-07-03 | 478200 |
| 2006-07-05 | 1483400 |
| 2006-07-06 | 2470200 |
| 2006-07-07 | 1328200 |
| 2006-07-10 | 1363600 |
| 2006-07-11 | 3542200 |
| 2006-07-12 | 1379400 |
| 2006-07-13 | 5580200 |
| 2006-07-14 | 2446800 |
| 2006-07-17 | 1489800 |
| 2006-07-18 | 1501600 |
| 2006-07-19 | 1320200 |
| 2006-07-20 | 975200 |
| 2006-07-21 | 1240000 |
| 2006-07-24 | 907400 |
| 2006-07-25 | 877600 |
| 2006-07-26 | 1796400 |
| 2006-07-27 | 1205400 |
| 2006-07-28 | 4736200 |
| 2006-07-31 | 3410400 |
| 2006-08-01 | 2998800 |
| 2006-08-02 | 1420400 |
| 2006-08-03 | 1314600 |
| 2006-08-04 | 1106000 |
| 2006-08-07 | 2282200 |
| 2006-08-08 | 2074200 |
| 2006-08-09 | 1664800 |
| 2006-08-10 | 1524600 |
| 2006-08-11 | 661600 |
| 2006-08-14 | 861600 |
| 2006-08-15 | 911600 |
| 2006-08-16 | 1244200 |
| 2006-08-17 | 1799000 |
| 2006-08-18 | 1223800 |
| 2006-08-21 | 843200 |
| 2006-08-22 | 1304600 |
| 2006-08-23 | 1310800 |
| 2006-08-24 | 1953200 |
| 2006-08-25 | 1285600 |
| 2006-08-28 | 1243400 |
| 2006-08-29 | 2004600 |
| 2006-08-30 | 1085800 |
| 2006-08-31 | 1112200 |
| 2006-09-01 | 1126800 |
| 2006-09-05 | 1266200 |
| 2006-09-06 | 1091400 |
| 2006-09-07 | 1668600 |
| 2006-09-08 | 1297400 |
| 2006-09-11 | 1009400 |
| 2006-09-12 | 927800 |
| 2006-09-13 | 3556200 |
| 2006-09-14 | 1379200 |
| 2006-09-15 | 1294800 |
| 2006-09-18 | 1141600 |
| 2006-09-19 | 2364000 |
| 2006-09-20 | 2051600 |
| 2006-09-21 | 1504200 |
| 2006-09-22 | 2622400 |
| 2006-09-25 | 1981200 |
| 2006-09-26 | 2387800 |
| 2006-09-27 | 2061800 |
| 2006-09-28 | 2671000 |
| 2006-09-29 | 8543400 |
| 2006-10-02 | 3954200 |
| 2006-10-03 | 5187200 |
| 2006-10-04 | 2521400 |
| 2006-10-05 | 3555000 |
| 2006-10-06 | 2425800 |
| 2006-10-09 | 1917200 |
| 2006-10-10 | 3290400 |
| 2006-10-11 | 1956000 |
| 2006-10-12 | 3633000 |
| 2006-10-13 | 2868800 |
| 2006-10-16 | 2060800 |
| 2006-10-17 | 2392400 |
| 2006-10-18 | 2242600 |
| 2006-10-19 | 3432000 |
| 2006-10-20 | 2808600 |
| 2006-10-23 | 2965600 |
| 2006-10-24 | 2128800 |
| 2006-10-25 | 1472600 |
| 2006-10-26 | 1631200 |
| 2006-10-27 | 2066000 |
| 2006-10-30 | 1535200 |
| 2006-10-31 | 1317400 |
| 2006-11-01 | 2284000 |
| 2006-11-02 | 1734200 |
| 2006-11-03 | 2019200 |
| 2006-11-06 | 2106000 |
| 2006-11-07 | 1911400 |
| 2006-11-08 | 1876600 |
| 2006-11-09 | 1494000 |
| 2006-11-10 | 1063200 |
| 2006-11-13 | 1445800 |
| 2006-11-14 | 1810400 |
| 2006-11-15 | 1834200 |
| 2006-11-16 | 1093000 |
| 2006-11-17 | 510000 |
| 2006-11-20 | 1211600 |
| 2006-11-21 | 692800 |
| 2006-11-22 | 817200 |
| 2006-11-24 | 274600 |
| 2006-11-27 | 1844400 |
| 2006-11-28 | 1514200 |
| 2006-11-29 | 1146400 |
| 2006-11-30 | 2021600 |
| 2006-12-01 | 896000 |
| 2006-12-04 | 1258400 |
| 2006-12-05 | 959200 |
| 2006-12-06 | 525200 |
| 2006-12-07 | 474600 |
| 2006-12-08 | 1338600 |
| 2006-12-11 | 994200 |
| 2006-12-12 | 1157200 |
| 2006-12-13 | 2068600 |
| 2006-12-14 | 1038200 |
| 2006-12-15 | 1195800 |
| 2006-12-18 | 1009800 |
| 2006-12-19 | 738400 |
| 2006-12-20 | 571000 |
| 2006-12-21 | 815600 |
| 2006-12-22 | 541000 |
| 2006-12-26 | 628200 |
| 2006-12-27 | 755600 |
| 2006-12-28 | 572800 |
| 2006-12-29 | 774000 |
| 2007-01-03 | 2104400 |
| 2007-01-04 | 2610800 |
| 2007-01-05 | 18244600 |
| 2007-01-08 | 4583600 |
| 2007-01-09 | 12356600 |
| 2007-01-10 | 3230800 |
| 2007-01-11 | 6035200 |
| 2007-01-12 | 5470400 |
| 2007-01-16 | 3282200 |
| 2007-01-17 | 2819400 |
| 2007-01-18 | 1810400 |
| 2007-01-19 | 1547400 |
| 2007-01-22 | 1784800 |
| 2007-01-23 | 2022800 |
| 2007-01-24 | 2263400 |
| 2007-01-25 | 2442200 |
| 2007-01-26 | 2052600 |
| 2007-01-29 | 1895000 |
| 2007-01-30 | 2127200 |
| 2007-01-31 | 3522000 |
| 2007-02-01 | 3788200 |
| 2007-02-02 | 2298800 |
| 2007-02-05 | 2186600 |
| 2007-02-06 | 1632200 |
| 2007-02-07 | 2083200 |
| 2007-02-08 | 3261000 |
| 2007-02-09 | 1469400 |
| 2007-02-12 | 1321660 |
| 2007-02-13 | 2043102 |
| 2007-02-14 | 2908838 |
| 2007-02-15 | 2340400 |
| 2007-02-16 | 1691800 |
| 2007-02-20 | 2509800 |
| 2007-02-21 | 1666000 |
| 2007-02-22 | 1292200 |
| 2007-02-23 | 2058200 |
| 2007-02-26 | 1434200 |
| 2007-02-27 | 2169600 |
| 2007-02-28 | 1913600 |
| 2007-03-01 | 1431242 |
| 2007-03-02 | 1137600 |
| 2007-03-05 | 1254400 |
| 2007-03-06 | 1375600 |
| 2007-03-07 | 764600 |
| 2007-03-08 | 1714800 |
| 2007-03-09 | 1646000 |
| 2007-03-12 | 806400 |
| 2007-03-13 | 1032800 |
| 2007-03-14 | 1737400 |
| 2007-03-15 | 818000 |
| 2007-03-16 | 905800 |
| 2007-03-19 | 1189600 |
| 2007-03-20 | 1600400 |
| 2007-03-21 | 2116204 |
| 2007-03-22 | 1053600 |
| 2007-03-23 | 1217400 |
| 2007-03-26 | 1987600 |
| 2007-03-27 | 1745600 |
| 2007-03-28 | 1849000 |
| 2007-03-29 | 2628600 |
| 2007-03-30 | 22963800 |
| 2007-04-02 | 11698800 |
| 2007-04-03 | 6157000 |
| 2007-04-04 | 2812400 |
| 2007-04-05 | 1897200 |
| 2007-04-09 | 2007822 |
| 2007-04-10 | 1626000 |
| 2007-04-11 | 3872800 |
| 2007-04-12 | 3308000 |
| 2007-04-13 | 4211008 |
| 2007-04-16 | 4373400 |
| 2007-04-17 | 4486200 |
| 2007-04-18 | 1970600 |
| 2007-04-19 | 1824000 |
| 2007-04-20 | 2196400 |
| 2007-04-23 | 1621400 |
| 2007-04-24 | 2138200 |
| 2007-04-25 | 1255200 |
| 2007-04-26 | 1240080 |
| 2007-04-27 | 825200 |
| 2007-04-30 | 2352600 |
| 2007-05-01 | 2567278 |
| 2007-05-02 | 950300 |
| 2007-05-03 | 800000 |
| 2007-05-04 | 1408000 |
| 2007-05-07 | 516600 |
| 2007-05-08 | 758000 |
| 2007-05-09 | 1057000 |
| 2007-05-10 | 958400 |
| 2007-05-11 | 854000 |
| 2007-05-14 | 1173000 |
| 2007-05-15 | 1869000 |
| 2007-05-16 | 2080400 |
| 2007-05-17 | 4380800 |
| 2007-05-18 | 3051400 |
| 2007-05-21 | 3188200 |
| 2007-05-22 | 789800 |
| 2007-05-23 | 1937200 |
| 2007-05-24 | 2289200 |
| 2007-05-25 | 952676 |
| 2007-05-29 | 751000 |
| 2007-05-30 | 1011250 |
| 2007-05-31 | 1810954 |
| 2007-06-01 | 1309000 |
| 2007-06-04 | 1481200 |
| 2007-06-05 | 709600 |
| 2007-06-06 | 888800 |
| 2007-06-07 | 2673800 |
| 2007-06-08 | 1226200 |
| 2007-06-11 | 771000 |
| 2007-06-12 | 1098800 |
| 2007-06-13 | 1032250 |
| 2007-06-14 | 575200 |
| 2007-06-15 | 1102000 |
| 2007-06-18 | 1078400 |
| 2007-06-19 | 766800 |
| 2007-06-20 | 876000 |
| 2007-06-21 | 1487162 |
| 2007-06-22 | 1461950 |
| 2007-06-25 | 2489200 |
| 2007-06-26 | 1021800 |
| 2007-06-27 | 1639600 |
| 2007-06-28 | 1538000 |
| 2007-06-29 | 1281600 |
| 2007-07-02 | 1088200 |
| 2007-07-03 | 420200 |
| 2007-07-05 | 707600 |
| 2007-07-06 | 570000 |
| 2007-07-09 | 675400 |
| 2007-07-10 | 969200 |
| 2007-07-11 | 769800 |
| 2007-07-12 | 789400 |
| 2007-07-13 | 584828 |
| 2007-07-16 | 1267200 |
| 2007-07-17 | 942600 |
| 2007-07-18 | 1988400 |
| 2007-07-19 | 1187400 |
| 2007-07-20 | 1054600 |
| 2007-07-23 | 959200 |
| 2007-07-24 | 1140600 |
| 2007-07-25 | 1459200 |
| 2007-07-26 | 6195700 |
| 2007-07-27 | 2650600 |
| 2007-07-30 | 2567200 |
| 2007-07-31 | 3745206 |
| 2007-08-01 | 2118600 |
| 2007-08-02 | 2304224 |
| 2007-08-03 | 2309880 |
| 2007-08-06 | 2848200 |
| 2007-08-07 | 2391000 |
| 2007-08-08 | 2285800 |
| 2007-08-09 | 3158600 |
| 2007-08-10 | 2562200 |
| 2007-08-13 | 1518600 |
| 2007-08-14 | 2843000 |
| 2007-08-15 | 1486000 |
| 2007-08-16 | 2302600 |
| 2007-08-17 | 1660800 |
| 2007-08-20 | 767600 |
| 2007-08-21 | 1543400 |
| 2007-08-22 | 3411000 |
| 2007-08-23 | 2017400 |
| 2007-08-24 | 964800 |
| 2007-08-27 | 819640 |
| 2007-08-28 | 1263200 |
| 2007-08-29 | 844400 |
| 2007-08-30 | 1617200 |
| 2007-08-31 | 777000 |
| 2007-09-04 | 1085200 |
| 2007-09-05 | 516000 |
| 2007-09-06 | 466600 |
| 2007-09-07 | 1517800 |
| 2007-09-10 | 689800 |
| 2007-09-11 | 688600 |
| 2007-09-12 | 934600 |
| 2007-09-13 | 552600 |
| 2007-09-14 | 720800 |
| 2007-09-17 | 681000 |
| 2007-09-18 | 1591600 |
| 2007-09-19 | 920400 |
| 2007-09-20 | 925200 |
| 2007-09-21 | 2584800 |
| 2007-09-24 | 1256600 |
| 2007-09-25 | 1592000 |
| 2007-09-26 | 2105200 |
| 2007-09-27 | 1785200 |
| 2007-09-28 | 4222200 |
| 2007-10-01 | 2722800 |
| 2007-10-02 | 1595000 |
| 2007-10-03 | 1937600 |
| 2007-10-04 | 1477800 |
| 2007-10-05 | 1211600 |
| 2007-10-08 | 1383400 |
| 2007-10-09 | 1053000 |
| 2007-10-10 | 856000 |
| 2007-10-11 | 1340800 |
| 2007-10-12 | 500000 |
| 2007-10-15 | 640600 |
| 2007-10-16 | 1023800 |
| 2007-10-17 | 1257400 |
| 2007-10-18 | 836600 |
| 2007-10-19 | 886000 |
| 2007-10-22 | 932800 |
| 2007-10-23 | 1047600 |
| 2007-10-24 | 2263200 |
| 2007-10-25 | 867000 |
| 2007-10-26 | 546600 |
| 2007-10-29 | 873200 |
| 2007-10-30 | 626200 |
| 2007-10-31 | 884400 |
| 2007-11-01 | 1990800 |
| 2007-11-02 | 1185000 |
| 2007-11-05 | 1358034 |
| 2007-11-06 | 705200 |
| 2007-11-07 | 1328000 |
| 2007-11-08 | 1865874 |
| 2007-11-09 | 1386600 |
| 2007-11-12 | 1250200 |
| 2007-11-13 | 1294600 |
| 2007-11-14 | 1027000 |
| 2007-11-15 | 1081000 |
| 2007-11-16 | 834600 |
| 2007-11-19 | 1550400 |
| 2007-11-20 | 1702800 |
| 2007-11-21 | 679600 |
| 2007-11-23 | 253200 |
| 2007-11-26 | 1121400 |
| 2007-11-27 | 4344860 |
| 2007-11-28 | 4081600 |
| 2007-11-29 | 2179294 |
| 2007-11-30 | 4640764 |
| 2007-12-03 | 948800 |
| 2007-12-04 | 1179404 |
| 2007-12-05 | 970800 |
| 2007-12-06 | 618600 |
| 2007-12-07 | 991430 |
| 2007-12-10 | 621110 |
| 2007-12-11 | 937782 |
| 2007-12-12 | 743600 |
| 2007-12-13 | 760000 |
| 2007-12-14 | 1175400 |
| 2007-12-17 | 1419802 |
| 2007-12-18 | 1064600 |
| 2007-12-19 | 914600 |
| 2007-12-20 | 1273932 |
| 2007-12-21 | 1202000 |
| 2007-12-24 | 730000 |
| 2007-12-26 | 1156040 |
| 2007-12-27 | 773000 |
| 2007-12-28 | 930988 |
| 2007-12-31 | 1246140 |
| 2008-01-02 | 2038388 |
| 2008-01-03 | 1800910 |
| 2008-01-04 | 8366540 |
| 2008-01-07 | 3804320 |
| 2008-01-08 | 4048000 |
| 2008-01-09 | 2178500 |
| 2008-01-10 | 2439944 |
| 2008-01-11 | 2213000 |
| 2008-01-14 | 1624702 |
| 2008-01-15 | 1856020 |
| 2008-01-16 | 1616074 |
| 2008-01-17 | 1232300 |
| 2008-01-18 | 1877200 |
| 2008-01-22 | 1977816 |
| 2008-01-23 | 3174064 |
| 2008-01-24 | 1592790 |
| 2008-01-25 | 1134800 |
| 2008-01-28 | 882408 |
| 2008-01-29 | 1895848 |
| 2008-01-30 | 1583600 |
| 2008-01-31 | 1979400 |
| 2008-02-01 | 1145000 |
| 2008-02-04 | 1501600 |
| 2008-02-05 | 1251800 |
| 2008-02-06 | 874000 |
| 2008-02-07 | 739400 |
| 2008-02-08 | 761400 |
| 2008-02-11 | 550000 |
| 2008-02-12 | 1050000 |
| 2008-02-13 | 710996 |
| 2008-02-14 | 1258200 |
| 2008-02-15 | 1009400 |
| 2008-02-19 | 811800 |
| 2008-02-20 | 576800 |
| 2008-02-21 | 751462 |
| 2008-02-22 | 1002400 |
| 2008-02-25 | 976600 |
| 2008-02-26 | 1997200 |
| 2008-02-27 | 2163000 |
| 2008-02-28 | 911198 |
| 2008-02-29 | 1657322 |
| 2008-03-03 | 737800 |
| 2008-03-04 | 952000 |
| 2008-03-05 | 614570 |
| 2008-03-06 | 1718494 |
| 2008-03-07 | 1001000 |
| 2008-03-10 | 1150600 |
| 2008-03-11 | 1250962 |
| 2008-03-12 | 1240000 |
| 2008-03-13 | 1529660 |
| 2008-03-14 | 1010200 |
| 2008-03-17 | 1082202 |
| 2008-03-18 | 1266800 |
| 2008-03-19 | 1570164 |
| 2008-03-20 | 1277000 |
| 2008-03-24 | 1432300 |
| 2008-03-25 | 1925996 |
| 2008-03-26 | 1270298 |
| 2008-03-27 | 1786600 |
| 2008-03-28 | 2240798 |
| 2008-03-31 | 1913200 |
| 2008-04-01 | 2226608 |
| 2008-04-02 | 2117400 |
| 2008-04-03 | 1296796 |
| 2008-04-04 | 974600 |
| 2008-04-07 | 659856 |
| 2008-04-08 | 770000 |
| 2008-04-09 | 835430 |
| 2008-04-10 | 1770000 |
| 2008-04-11 | 529400 |
| 2008-04-14 | 590172 |
| 2008-04-15 | 842768 |
| 2008-04-16 | 687200 |
| 2008-04-17 | 1024554 |
| 2008-04-18 | 761614 |
| 2008-04-21 | 560710 |
| 2008-04-22 | 597524 |
| 2008-04-23 | 717150 |
| 2008-04-24 | 1229684 |
| 2008-04-25 | 1200526 |
| 2008-04-28 | 958902 |
| 2008-04-29 | 1509934 |
| 2008-04-30 | 1354660 |
| 2008-05-01 | 1451618 |
| 2008-05-02 | 1386136 |
| 2008-05-05 | 788284 |
| 2008-05-06 | 1629808 |
| 2008-05-07 | 1100734 |
| 2008-05-08 | 1338312 |
| 2008-05-09 | 526096 |
| 2008-05-12 | 965064 |
| 2008-05-13 | 1294684 |
| 2008-05-14 | 707976 |
| 2008-05-15 | 567414 |
| 2008-05-16 | 1422858 |
| 2008-05-19 | 730596 |
| 2008-05-20 | 616052 |
| 2008-05-21 | 1093578 |
| 2008-05-22 | 608630 |
| 2008-05-23 | 290924 |
| 2008-05-27 | 1134590 |
| 2008-05-28 | 662428 |
| 2008-05-29 | 1114828 |
| 2008-05-30 | 888482 |
| 2008-06-02 | 740082 |
| 2008-06-03 | 865834 |
| 2008-06-04 | 1296736 |
| 2008-06-05 | 1120750 |
| 2008-06-06 | 649746 |
| 2008-06-09 | 781404 |
| 2008-06-10 | 1205794 |
| 2008-06-11 | 1071260 |
| 2008-06-12 | 1396056 |
| 2008-06-13 | 939672 |
| 2008-06-16 | 1065598 |
| 2008-06-17 | 964506 |
| 2008-06-18 | 1059264 |
| 2008-06-19 | 717948 |
| 2008-06-20 | 1671382 |
| 2008-06-23 | 1097696 |
| 2008-06-24 | 877688 |
| 2008-06-25 | 1160690 |
| 2008-06-26 | 951900 |
| 2008-06-27 | 674222 |
| 2008-06-30 | 801324 |
| 2008-07-01 | 918338 |
| 2008-07-02 | 1036558 |
| 2008-07-03 | 367210 |
| 2008-07-07 | 1061408 |
| 2008-07-08 | 948658 |
| 2008-07-09 | 608430 |
| 2008-07-10 | 1606310 |
| 2008-07-11 | 1350362 |
| 2008-07-14 | 911766 |
| 2008-07-15 | 1231172 |
| 2008-07-16 | 1097788 |
| 2008-07-17 | 566696 |
| 2008-07-18 | 532670 |
| 2008-07-21 | 1066120 |
| 2008-07-22 | 1227010 |
| 2008-07-23 | 1255934 |
| 2008-07-24 | 1328274 |
| 2008-07-25 | 3102610 |
| 2008-07-28 | 2238152 |
| 2008-07-29 | 1014780 |
| 2008-07-30 | 1379298 |
| 2008-07-31 | 1218490 |
| 2008-08-01 | 1097734 |
| 2008-08-04 | 798270 |
| 2008-08-05 | 1128816 |
| 2008-08-06 | 978112 |
| 2008-08-07 | 1039256 |
| 2008-08-08 | 1238658 |
| 2008-08-11 | 1500550 |
| 2008-08-12 | 1252092 |
| 2008-08-13 | 1130712 |
| 2008-08-14 | 865418 |
| 2008-08-15 | 678118 |
| 2008-08-18 | 1046886 |
| 2008-08-19 | 963816 |
| 2008-08-20 | 932524 |
| 2008-08-21 | 3315878 |
| 2008-08-22 | 1776716 |
| 2008-08-25 | 779560 |
| 2008-08-26 | 1077054 |
| 2008-08-27 | 1154566 |
| 2008-08-28 | 1241302 |
| 2008-08-29 | 945666 |
| 2008-09-02 | 1045558 |
| 2008-09-03 | 1135788 |
| 2008-09-04 | 1281368 |
| 2008-09-05 | 1689140 |
| 2008-09-08 | 2341696 |
| 2008-09-09 | 1978606 |
| 2008-09-10 | 1249198 |
| 2008-09-11 | 1391200 |
| 2008-09-12 | 1414712 |
| 2008-09-15 | 1686844 |
| 2008-09-16 | 1789928 |
| 2008-09-17 | 1585318 |
| 2008-09-18 | 2128234 |
| 2008-09-19 | 2410470 |
| 2008-09-22 | 1274850 |
| 2008-09-23 | 1212004 |
| 2008-09-24 | 609580 |
| 2008-09-25 | 696242 |
| 2008-09-26 | 1210554 |
| 2008-09-29 | 1667900 |
| 2008-09-30 | 1189100 |
| 2008-10-01 | 1658472 |
| 2008-10-02 | 1782356 |
| 2008-10-03 | 6847298 |
| 2008-10-06 | 3364506 |
| 2008-10-07 | 2642960 |
| 2008-10-08 | 2660422 |
| 2008-10-09 | 2098710 |
| 2008-10-10 | 3628296 |
| 2008-10-13 | 1921338 |
| 2008-10-14 | 1924508 |
| 2008-10-15 | 1371618 |
| 2008-10-16 | 1808822 |
| 2008-10-17 | 1560138 |
| 2008-10-20 | 947296 |
| 2008-10-21 | 1273018 |
| 2008-10-22 | 2301386 |
| 2008-10-23 | 1788508 |
| 2008-10-24 | 1781728 |
| 2008-10-27 | 1182608 |
| 2008-10-28 | 1404362 |
| 2008-10-29 | 1548084 |
| 2008-10-30 | 1624282 |
| 2008-10-31 | 1036378 |
| 2008-11-03 | 1232844 |
| 2008-11-04 | 1929948 |
| 2008-11-05 | 1339422 |
| 2008-11-06 | 1997012 |
| 2008-11-07 | 1663798 |
| 2008-11-10 | 1269972 |
| 2008-11-11 | 1324518 |
| 2008-11-12 | 1624686 |
| 2008-11-13 | 2688534 |
| 2008-11-14 | 1397666 |
| 2008-11-17 | 1473134 |
| 2008-11-18 | 1744092 |
| 2008-11-19 | 1415168 |
| 2008-11-20 | 1464424 |
| 2008-11-21 | 2349826 |
| 2008-11-24 | 2130068 |
| 2008-11-25 | 3886502 |
| 2008-11-26 | 1374352 |
| 2008-11-28 | 520276 |
| 2008-12-01 | 1356360 |
| 2008-12-02 | 1892042 |
| 2008-12-03 | 1306456 |
| 2008-12-04 | 1712238 |
| 2008-12-05 | 1419358 |
| 2008-12-08 | 1288028 |
| 2008-12-09 | 1551164 |
| 2008-12-10 | 1152662 |
| 2008-12-11 | 1090294 |
| 2008-12-12 | 1062164 |
| 2008-12-15 | 1345266 |
| 2008-12-16 | 1015256 |
| 2008-12-17 | 1494802 |
| 2008-12-18 | 1299030 |
| 2008-12-19 | 1866898 |
| 2008-12-22 | 1232068 |
| 2008-12-23 | 1623288 |
| 2008-12-24 | 593070 |
| 2008-12-26 | 495076 |
| 2008-12-29 | 710446 |
| 2008-12-30 | 1165804 |
| 2008-12-31 | 1448404 |
| 2009-01-02 | 1503350 |
| 2009-01-05 | 1378082 |
| 2009-01-06 | 1859026 |
| 2009-01-07 | 3613488 |
| 2009-01-08 | 1753552 |
| 2009-01-09 | 2100970 |
| 2009-01-12 | 2143278 |
| 2009-01-13 | 2135762 |
| 2009-01-14 | 2749958 |
| 2009-01-15 | 2241478 |
| 2009-01-16 | 1829498 |
| 2009-01-20 | 3724922 |
| 2009-01-21 | 1708246 |
| 2009-01-22 | 2118882 |
| 2009-01-23 | 1456602 |
| 2009-01-26 | 1844072 |
| 2009-01-27 | 1729722 |
| 2009-01-28 | 1873758 |
| 2009-01-29 | 1309510 |
| 2009-01-30 | 2007604 |
| 2009-02-02 | 2178090 |
| 2009-02-03 | 1752042 |
| 2009-02-04 | 1682802 |
| 2009-02-05 | 1180326 |
| 2009-02-06 | 1436490 |
| 2009-02-09 | 702308 |
| 2009-02-10 | 1131300 |
| 2009-02-11 | 888570 |
| 2009-02-12 | 1064442 |
| 2009-02-13 | 879420 |
| 2009-02-17 | 1664546 |
| 2009-02-18 | 1196520 |
| 2009-02-19 | 1388014 |
| 2009-02-20 | 1540778 |
| 2009-02-23 | 1835392 |
| 2009-02-24 | 1580994 |
| 2009-02-25 | 1194468 |
| 2009-02-26 | 1253328 |
| 2009-02-27 | 2325896 |
| 2009-03-02 | 2073460 |
| 2009-03-03 | 2264976 |
| 2009-03-04 | 2199436 |
| 2009-03-05 | 1709736 |
| 2009-03-06 | 1804866 |
| 2009-03-09 | 1304810 |
| 2009-03-10 | 1957134 |
| 2009-03-11 | 2114038 |
| 2009-03-12 | 2145184 |
| 2009-03-13 | 2191724 |
| 2009-03-16 | 1741668 |
| 2009-03-17 | 1084738 |
| 2009-03-18 | 1686158 |
| 2009-03-19 | 1202904 |
| 2009-03-20 | 2040396 |
| 2009-03-23 | 1879118 |
| 2009-03-24 | 1425090 |
| 2009-03-25 | 1541514 |
| 2009-03-26 | 1750694 |
| 2009-03-27 | 1192716 |
| 2009-03-30 | 1693600 |
| 2009-03-31 | 1560932 |
| 2009-04-01 | 2024538 |
| 2009-04-02 | 2203428 |
| 2009-04-03 | 6033914 |
| 2009-04-06 | 2205112 |
| 2009-04-07 | 2991426 |
| 2009-04-08 | 1997554 |
| 2009-04-09 | 2730220 |
| 2009-04-13 | 1663522 |
| 2009-04-14 | 1730646 |
| 2009-04-15 | 1368682 |
| 2009-04-16 | 1269224 |
| 2009-04-17 | 1967558 |
| 2009-04-20 | 1721146 |
| 2009-04-21 | 2085852 |
| 2009-04-22 | 2464196 |
| 2009-04-23 | 2016306 |
| 2009-04-24 | 4047210 |
| 2009-04-27 | 2247316 |
| 2009-04-28 | 1122802 |
| 2009-04-29 | 1839806 |
| 2009-04-30 | 1997516 |
| 2009-05-01 | 1753978 |
| 2009-05-04 | 2476728 |
| 2009-05-05 | 1990838 |
| 2009-05-06 | 2963958 |
| 2009-05-07 | 2260878 |
| 2009-05-08 | 1473874 |
| 2009-05-11 | 1952328 |
| 2009-05-12 | 1760798 |
| 2009-05-13 | 2466784 |
| 2009-05-14 | 2528418 |
| 2009-05-15 | 2368560 |
| 2009-05-18 | 2240706 |
| 2009-05-19 | 3625908 |
| 2009-05-20 | 2792762 |
| 2009-05-21 | 2896004 |
| 2009-05-22 | 1916456 |
| 2009-05-26 | 2189652 |
| 2009-05-27 | 1901858 |
| 2009-05-28 | 1791650 |
| 2009-05-29 | 1385836 |
| 2009-06-01 | 2258818 |
| 2009-06-02 | 1603796 |
| 2009-06-03 | 1323922 |
| 2009-06-04 | 2040206 |
| 2009-06-05 | 1391976 |
| 2009-06-08 | 1298024 |
| 2009-06-09 | 1110098 |
| 2009-06-10 | 779832 |
| 2009-06-11 | 757872 |
| 2009-06-12 | 2671926 |
| 2009-06-15 | 1910612 |
| 2009-06-16 | 1812030 |
| 2009-06-17 | 1465492 |
| 2009-06-18 | 2073616 |
| 2009-06-19 | 1979154 |
| 2009-06-22 | 1580802 |
| 2009-06-23 | 1180250 |
| 2009-06-24 | 1045802 |
| 2009-06-25 | 1025408 |
| 2009-06-26 | 1252442 |
| 2009-06-29 | 923770 |
| 2009-06-30 | 1379508 |
| 2009-07-01 | 1806058 |
| 2009-07-02 | 889100 |
| 2009-07-06 | 871604 |
| 2009-07-07 | 977552 |
| 2009-07-08 | 1554798 |
| 2009-07-09 | 787546 |
| 2009-07-10 | 808562 |
| 2009-07-13 | 1417142 |
| 2009-07-14 | 660192 |
| 2009-07-15 | 1386958 |
| 2009-07-16 | 776494 |
| 2009-07-17 | 431978 |
| 2009-07-20 | 828562 |
| 2009-07-21 | 570922 |
| 2009-07-22 | 1519510 |
| 2009-07-23 | 2332354 |
| 2009-07-24 | 3369102 |
| 2009-07-27 | 2559668 |
| 2009-07-28 | 1452862 |
| 2009-07-29 | 707160 |
| 2009-07-30 | 1072426 |
| 2009-07-31 | 830808 |
| 2009-08-03 | 1324810 |
| 2009-08-04 | 901758 |
| 2009-08-05 | 698672 |
| 2009-08-06 | 655970 |
| 2009-08-07 | 519546 |
| 2009-08-10 | 396460 |
| 2009-08-11 | 525626 |
| 2009-08-12 | 602452 |
| 2009-08-13 | 497726 |
| 2009-08-14 | 399436 |
| 2009-08-17 | 866568 |
| 2009-08-18 | 617466 |
| 2009-08-19 | 588480 |
| 2009-08-20 | 700526 |
| 2009-08-21 | 1256822 |
| 2009-08-24 | 718598 |
| 2009-08-25 | 824292 |
| 2009-08-26 | 781066 |
| 2009-08-27 | 558354 |
| 2009-08-28 | 653802 |
| 2009-08-31 | 1081774 |
| 2009-09-01 | 2139908 |
| 2009-09-02 | 1319056 |
| 2009-09-03 | 1083950 |
| 2009-09-04 | 952364 |
| 2009-09-08 | 930424 |
| 2009-09-09 | 1327668 |
| 2009-09-10 | 515422 |
| 2009-09-11 | 586532 |
| 2009-09-14 | 422622 |
| 2009-09-15 | 582502 |
| 2009-09-16 | 840466 |
| 2009-09-17 | 516484 |
| 2009-09-18 | 1231278 |
| 2009-09-21 | 467780 |
| 2009-09-22 | 562390 |
| 2009-09-23 | 608970 |
| 2009-09-24 | 838708 |
| 2009-09-25 | 824028 |
| 2009-09-28 | 939698 |
| 2009-09-29 | 798850 |
| 2009-09-30 | 1790126 |
| 2009-10-01 | 1287766 |
| 2009-10-02 | 2394726 |
| 2009-10-05 | 2599524 |
| 2009-10-06 | 2854548 |
| 2009-10-07 | 1624520 |
| 2009-10-08 | 1247098 |
| 2009-10-09 | 1517988 |
| 2009-10-12 | 766382 |
| 2009-10-13 | 1177304 |
| 2009-10-14 | 1300114 |
| 2009-10-15 | 1710644 |
| 2009-10-16 | 2073420 |
| 2009-10-19 | 2109676 |
| 2009-10-20 | 1753482 |
| 2009-10-21 | 1699954 |
| 2009-10-22 | 2555306 |
| 2009-10-23 | 1591176 |
| 2009-10-26 | 1329780 |
| 2009-10-27 | 1459602 |
| 2009-10-28 | 1264850 |
| 2009-10-29 | 1089916 |
| 2009-10-30 | 1512226 |
| 2009-11-02 | 1146646 |
| 2009-11-03 | 1662332 |
| 2009-11-04 | 1552748 |
| 2009-11-05 | 1883658 |
| 2009-11-06 | 1302716 |
| 2009-11-09 | 1508924 |
| 2009-11-10 | 1493080 |
| 2009-11-11 | 939816 |
| 2009-11-12 | 807394 |
| 2009-11-13 | 1068170 |
| 2009-11-16 | 959322 |
| 2009-11-17 | 1029318 |
| 2009-11-18 | 2321864 |
| 2009-11-19 | 3739188 |
| 2009-11-20 | 1631024 |
| 2009-11-23 | 1720252 |
| 2009-11-24 | 1836728 |
| 2009-11-25 | 796326 |
| 2009-11-27 | 574110 |
| 2009-11-30 | 859506 |
| 2009-12-01 | 886682 |
| 2009-12-02 | 1588174 |
| 2009-12-03 | 1209524 |
| 2009-12-04 | 1744532 |
| 2009-12-07 | 1006616 |
| 2009-12-08 | 1005090 |
| 2009-12-09 | 1161968 |
| 2009-12-10 | 772286 |
| 2009-12-11 | 1217828 |
| 2009-12-14 | 1090730 |
| 2009-12-15 | 994494 |
| 2009-12-16 | 1097682 |
| 2009-12-17 | 639074 |
| 2009-12-18 | 1199042 |
| 2009-12-21 | 672772 |
| 2009-12-22 | 1188858 |
| 2009-12-23 | 948926 |
| 2009-12-24 | 191926 |
| 2009-12-28 | 521518 |
| 2009-12-29 | 1011054 |
| 2009-12-30 | 1470496 |
| 2009-12-31 | 816934 |
| 2010-01-04 | 2533360 |
| 2010-01-05 | 1288556 |
| 2010-01-06 | 1628140 |
| 2010-01-07 | 2470282 |
| 2010-01-08 | 6436994 |
| 2010-01-11 | 4421632 |
| 2010-01-12 | 2311180 |
| 2010-01-13 | 2179542 |
| 2010-01-14 | 2981530 |
| 2010-01-15 | 2340662 |
| 2010-01-19 | 2058444 |
| 2010-01-20 | 2187926 |
| 2010-01-21 | 3046644 |
| 2010-01-22 | 2421026 |
| 2010-01-25 | 2003546 |
| 2010-01-26 | 1947938 |
| 2010-01-27 | 2506114 |
| 2010-01-28 | 2522180 |
| 2010-01-29 | 2063118 |
| 2010-02-01 | 1521862 |
| 2010-02-02 | 1491012 |
| 2010-02-03 | 1595080 |
| 2010-02-04 | 2590578 |
| 2010-02-05 | 2548062 |
| 2010-02-08 | 1417678 |
| 2010-02-09 | 1079446 |
| 2010-02-10 | 740292 |
| 2010-02-11 | 696992 |
| 2010-02-12 | 2654850 |
| 2010-02-16 | 2835226 |
| 2010-02-17 | 3589610 |
| 2010-02-18 | 2534836 |
| 2010-02-19 | 2135962 |
| 2010-02-22 | 1924358 |
| 2010-02-23 | 2872808 |
| 2010-02-24 | 1398600 |
| 2010-02-25 | 1430926 |
| 2010-02-26 | 1969752 |
| 2010-03-01 | 2412864 |
| 2010-03-02 | 1794962 |
| 2010-03-03 | 1580020 |
| 2010-03-04 | 1299952 |
| 2010-03-05 | 1486338 |
| 2010-03-08 | 916666 |
| 2010-03-09 | 2740800 |
| 2010-03-10 | 2272312 |
| 2010-03-11 | 1323390 |
| 2010-03-12 | 1298518 |
| 2010-03-15 | 1133288 |
| 2010-03-16 | 781354 |
| 2010-03-17 | 1786776 |
| 2010-03-18 | 1018516 |
| 2010-03-19 | 1746846 |
| 2010-03-22 | 929988 |
| 2010-03-23 | 972740 |
| 2010-03-24 | 1634700 |
| 2010-03-25 | 1335210 |
| 2010-03-26 | 1681434 |
| 2010-03-29 | 1008634 |
| 2010-03-30 | 2114208 |
| 2010-03-31 | 3136704 |
| 2010-04-01 | 7231448 |
| 2010-04-05 | 4005060 |
| 2010-04-06 | 2748260 |
| 2010-04-07 | 3634636 |
| 2010-04-08 | 2802680 |
| 2010-04-09 | 1893402 |
| 2010-04-12 | 2554238 |
| 2010-04-13 | 2185136 |
| 2010-04-14 | 2763614 |
| 2010-04-15 | 3829526 |
| 2010-04-16 | 5495772 |
| 2010-04-19 | 3899826 |
| 2010-04-20 | 2938024 |
| 2010-04-21 | 2796714 |
| 2010-04-22 | 2491652 |
| 2010-04-23 | 2327528 |
| 2010-04-26 | 2158012 |
| 2010-04-27 | 2838882 |
| 2010-04-28 | 1644810 |
| 2010-04-29 | 2212952 |
| 2010-04-30 | 3140774 |
| 2010-05-03 | 2613446 |
| 2010-05-04 | 2269644 |
| 2010-05-05 | 2705138 |
| 2010-05-06 | 6863130 |
| 2010-05-07 | 5678642 |
| 2010-05-10 | 3078186 |
| 2010-05-11 | 2409260 |
| 2010-05-12 | 1814816 |
| 2010-05-13 | 4654928 |
| 2010-05-14 | 3894364 |
| 2010-05-17 | 3715850 |
| 2010-05-18 | 4040940 |
| 2010-05-19 | 3694684 |
| 2010-05-20 | 4786648 |
| 2010-05-21 | 4205186 |
| 2010-05-24 | 2557016 |
| 2010-05-25 | 3276514 |
| 2010-05-26 | 3306526 |
| 2010-05-27 | 1842186 |
| 2010-05-28 | 2111190 |
| 2010-06-01 | 2911806 |
| 2010-06-02 | 1654662 |
| 2010-06-03 | 1840132 |
| 2010-06-04 | 1495172 |
| 2010-06-07 | 1449160 |
| 2010-06-08 | 1415408 |
| 2010-06-09 | 1420376 |
| 2010-06-10 | 1511300 |
| 2010-06-11 | 1230932 |
| 2010-06-14 | 862566 |
| 2010-06-15 | 1157478 |
| 2010-06-16 | 1405708 |
| 2010-06-17 | 726060 |
| 2010-06-18 | 642974 |
| 2010-06-21 | 8140216 |
| 2010-06-22 | 3561640 |
| 2010-06-23 | 2010612 |
| 2010-06-24 | 1657786 |
| 2010-06-25 | 1966166 |
| 2010-06-28 | 897368 |
| 2010-06-29 | 1565486 |
| 2010-06-30 | 2489714 |
| 2010-07-01 | 2631028 |
| 2010-07-02 | 875758 |
| 2010-07-06 | 1403268 |
| 2010-07-07 | 1150066 |
| 2010-07-08 | 1416440 |
| 2010-07-09 | 940808 |
| 2010-07-12 | 847032 |
| 2010-07-13 | 1216124 |
| 2010-07-14 | 679522 |
| 2010-07-15 | 965980 |
| 2010-07-16 | 1073358 |
| 2010-07-19 | 672916 |
| 2010-07-20 | 1109538 |
| 2010-07-21 | 1282970 |
| 2010-07-22 | 1437016 |
| 2010-07-23 | 1560694 |
| 2010-07-26 | 1317090 |
| 2010-07-27 | 1599296 |
| 2010-07-28 | 9351536 |
| 2010-07-29 | 3220464 |
| 2010-07-30 | 2132856 |
| 2010-08-02 | 2140186 |
| 2010-08-03 | 1635658 |
| 2010-08-04 | 2423378 |
| 2010-08-05 | 973816 |
| 2010-08-06 | 1149082 |
| 2010-08-09 | 907488 |
| 2010-08-10 | 907180 |
| 2010-08-11 | 1505218 |
| 2010-08-12 | 1285556 |
| 2010-08-13 | 880300 |
| 2010-08-16 | 541498 |
| 2010-08-17 | 793238 |
| 2010-08-18 | 520486 |
| 2010-08-19 | 701090 |
| 2010-08-20 | 852586 |
| 2010-08-23 | 469610 |
| 2010-08-24 | 1698504 |
| 2010-08-25 | 899130 |
| 2010-08-26 | 752118 |
| 2010-08-27 | 667110 |
| 2010-08-30 | 931324 |
| 2010-08-31 | 1099008 |
| 2010-09-01 | 1183316 |
| 2010-09-02 | 641754 |
| 2010-09-03 | 627040 |
| 2010-09-07 | 685020 |
| 2010-09-08 | 669636 |
| 2010-09-09 | 669928 |
| 2010-09-10 | 460130 |
| 2010-09-13 | 739260 |
| 2010-09-14 | 533094 |
| 2010-09-15 | 879922 |
| 2010-09-16 | 820682 |
| 2010-09-17 | 962978 |
| 2010-09-20 | 955314 |
| 2010-09-21 | 873634 |
| 2010-09-22 | 431956 |
| 2010-09-23 | 885760 |
| 2010-09-24 | 800218 |
| 2010-09-27 | 905686 |
| 2010-09-28 | 841310 |
| 2010-09-29 | 926686 |
| 2010-09-30 | 1430426 |
| 2010-10-01 | 1941360 |
| 2010-10-04 | 949292 |
| 2010-10-05 | 1129098 |
| 2010-10-06 | 516152 |
| 2010-10-07 | 596810 |
| 2010-10-08 | 591480 |
| 2010-10-11 | 871964 |
| 2010-10-12 | 9053548 |
| 2010-10-13 | 2535282 |
| 2010-10-14 | 1386254 |
| 2010-10-15 | 1439788 |
| 2010-10-18 | 1080674 |
| 2010-10-19 | 1459746 |
| 2010-10-20 | 1929624 |
| 2010-10-21 | 2149418 |
| 2010-10-22 | 1749972 |
| 2010-10-25 | 2608154 |
| 2010-10-26 | 1680912 |
| 2010-10-27 | 1862896 |
| 2010-10-28 | 830846 |
| 2010-10-29 | 738002 |
| 2010-11-01 | 797534 |
| 2010-11-02 | 1174208 |
| 2010-11-03 | 1116222 |
| 2010-11-04 | 1695014 |
| 2010-11-05 | 2660322 |
| 2010-11-08 | 1110864 |
| 2010-11-09 | 933212 |
| 2010-11-10 | 1221664 |
| 2010-11-11 | 868742 |
| 2010-11-12 | 1490936 |
| 2010-11-15 | 1078468 |
| 2010-11-16 | 1250468 |
| 2010-11-17 | 1387482 |
| 2010-11-18 | 878734 |
| 2010-11-19 | 685880 |
| 2010-11-22 | 779084 |
| 2010-11-23 | 730498 |
| 2010-11-24 | 592050 |
| 2010-11-26 | 303442 |
| 2010-11-29 | 886284 |
| 2010-11-30 | 1132268 |
| 2010-12-01 | 1126312 |
| 2010-12-02 | 876480 |
| 2010-12-03 | 1870000 |
| 2010-12-06 | 1420056 |
| 2010-12-07 | 1158474 |
| 2010-12-08 | 1242618 |
| 2010-12-09 | 1282580 |
| 2010-12-10 | 520826 |
| 2010-12-13 | 658520 |
| 2010-12-14 | 766640 |
| 2010-12-15 | 970962 |
| 2010-12-16 | 2077890 |
| 2010-12-17 | 1491094 |
| 2010-12-20 | 618158 |
| 2010-12-21 | 698924 |
| 2010-12-22 | 983358 |
| 2010-12-23 | 574682 |
| 2010-12-27 | 511544 |
| 2010-12-28 | 844020 |
| 2010-12-29 | 830832 |
| 2010-12-30 | 693730 |
| 2010-12-31 | 627868 |
| 2011-01-03 | 1089246 |
| 2011-01-04 | 1602792 |
| 2011-01-05 | 1407566 |
| 2011-01-06 | 1733260 |
| 2011-01-07 | 2838128 |
| 2011-01-10 | 1291502 |
| 2011-01-11 | 1167864 |
| 2011-01-12 | 1177568 |
| 2011-01-13 | 1065104 |
| 2011-01-14 | 1824612 |
| 2011-01-18 | 1680844 |
| 2011-01-19 | 1436026 |
| 2011-01-20 | 1057382 |
| 2011-01-21 | 765520 |
| 2011-01-24 | 832466 |
| 2011-01-25 | 888244 |
| 2011-01-26 | 465240 |
| 2011-01-27 | 533844 |
| 2011-01-28 | 799140 |
| 2011-01-31 | 967862 |
| 2011-02-01 | 967256 |
| 2011-02-02 | 825920 |
| 2011-02-03 | 927786 |
| 2011-02-04 | 1084442 |
| 2011-02-07 | 918920 |
| 2011-02-08 | 1311030 |
| 2011-02-09 | 809494 |
| 2011-02-10 | 810832 |
| 2011-02-11 | 334042 |
| 2011-02-14 | 457378 |
| 2011-02-15 | 583432 |
| 2011-02-16 | 544936 |
| 2011-02-17 | 429052 |
| 2011-02-18 | 894942 |
| 2011-02-22 | 802192 |
| 2011-02-23 | 1327668 |
| 2011-02-24 | 1229942 |
| 2011-02-25 | 707768 |
| 2011-02-28 | 426470 |
| 2011-03-01 | 591970 |
| 2011-03-02 | 672558 |
| 2011-03-03 | 570732 |
| 2011-03-04 | 507602 |
| 2011-03-07 | 443164 |
| 2011-03-08 | 672564 |
| 2011-03-09 | 396502 |
| 2011-03-10 | 453600 |
| 2011-03-11 | 615542 |
| 2011-03-14 | 385456 |
| 2011-03-15 | 845310 |
| 2011-03-16 | 908662 |
| 2011-03-17 | 420778 |
| 2011-03-18 | 1006104 |
| 2011-03-21 | 691360 |
| 2011-03-22 | 399020 |
| 2011-03-23 | 279374 |
| 2011-03-24 | 290022 |
| 2011-03-25 | 356800 |
| 2011-03-28 | 652140 |
| 2011-03-29 | 873568 |
| 2011-03-30 | 789180 |
| 2011-03-31 | 1006986 |
| 2011-04-01 | 5691094 |
| 2011-04-04 | 1637024 |
| 2011-04-05 | 2736218 |
| 2011-04-06 | 1461752 |
| 2011-04-07 | 1111818 |
| 2011-04-08 | 703114 |
| 2011-04-11 | 1036928 |
| 2011-04-12 | 813034 |
| 2011-04-13 | 585434 |
| 2011-04-14 | 1340918 |
| 2011-04-15 | 1203456 |
| 2011-04-18 | 836156 |
| 2011-04-19 | 1024222 |
| 2011-04-20 | 940056 |
| 2011-04-21 | 903108 |
| 2011-04-25 | 945168 |
| 2011-04-26 | 1111952 |
| 2011-04-27 | 937054 |
| 2011-04-28 | 1414982 |
| 2011-04-29 | 776118 |
| 2011-05-02 | 833844 |
| 2011-05-03 | 1046552 |
| 2011-05-04 | 924878 |
| 2011-05-05 | 1053552 |
| 2011-05-06 | 1233768 |
| 2011-05-09 | 724448 |
| 2011-05-10 | 664102 |
| 2011-05-11 | 649102 |
| 2011-05-12 | 1308388 |
| 2011-05-13 | 790494 |
| 2011-05-16 | 858842 |
| 2011-05-17 | 852794 |
| 2011-05-18 | 2231158 |
| 2011-05-19 | 1550926 |
| 2011-05-20 | 1432098 |
| 2011-05-23 | 715390 |
| 2011-05-24 | 645218 |
| 2011-05-25 | 1514276 |
| 2011-05-26 | 1560490 |
| 2011-05-27 | 653766 |
| 2011-05-31 | 1104758 |
| 2011-06-01 | 828886 |
| 2011-06-02 | 920912 |
| 2011-06-03 | 787592 |
| 2011-06-06 | 1368922 |
| 2011-06-07 | 1471286 |
| 2011-06-08 | 2087232 |
| 2011-06-09 | 941594 |
| 2011-06-10 | 1366732 |
| 2011-06-13 | 760062 |
| 2011-06-14 | 1167430 |
| 2011-06-15 | 795372 |
| 2011-06-16 | 846738 |
| 2011-06-17 | 1239912 |
| 2011-06-20 | 780844 |
| 2011-06-21 | 782524 |
| 2011-06-22 | 623486 |
| 2011-06-23 | 904786 |
| 2011-06-24 | 587668 |
| 2011-06-27 | 537544 |
| 2011-06-28 | 824448 |
| 2011-06-29 | 1493868 |
| 2011-06-30 | 1099458 |
| 2011-07-01 | 878974 |
| 2011-07-05 | 637048 |
| 2011-07-06 | 630894 |
| 2011-07-07 | 804000 |
| 2011-07-08 | 785648 |
| 2011-07-11 | 670610 |
| 2011-07-12 | 890704 |
| 2011-07-13 | 1265114 |
| 2011-07-14 | 1803646 |
| 2011-07-15 | 979738 |
| 2011-07-18 | 664832 |
| 2011-07-19 | 962154 |
| 2011-07-20 | 949506 |
| 2011-07-21 | 1301880 |
| 2011-07-22 | 6485366 |
| 2011-07-25 | 2143202 |
| 2011-07-26 | 1476364 |
| 2011-07-27 | 1927136 |
| 2011-07-28 | 1263800 |
| 2011-07-29 | 1010292 |
| 2011-08-01 | 1336032 |
| 2011-08-02 | 667530 |
| 2011-08-03 | 1571576 |
| 2011-08-04 | 1555178 |
| 2011-08-05 | 1681040 |
| 2011-08-08 | 2268520 |
| 2011-08-09 | 4921014 |
| 2011-08-10 | 2852018 |
| 2011-08-11 | 2679698 |
| 2011-08-12 | 1582692 |
| 2011-08-15 | 1167858 |
| 2011-08-16 | 988716 |
| 2011-08-17 | 831014 |
| 2011-08-18 | 1420300 |
| 2011-08-19 | 1593536 |
| 2011-08-22 | 1897024 |
| 2011-08-23 | 2338402 |
| 2011-08-24 | 1752110 |
| 2011-08-25 | 2031716 |
| 2011-08-26 | 1650032 |
| 2011-08-29 | 1249380 |
| 2011-08-30 | 1720210 |
| 2011-08-31 | 1397800 |
| 2011-09-01 | 1681950 |
| 2011-09-02 | 1415672 |
| 2011-09-06 | 2358736 |
| 2011-09-07 | 1308324 |
| 2011-09-08 | 988114 |
| 2011-09-09 | 1582950 |
| 2011-09-12 | 1313136 |
| 2011-09-13 | 1096858 |
| 2011-09-14 | 1451098 |
| 2011-09-15 | 1675198 |
| 2011-09-16 | 1537842 |
| 2011-09-19 | 909548 |
| 2011-09-20 | 1191624 |
| 2011-09-21 | 1226954 |
| 2011-09-22 | 2529742 |
| 2011-09-23 | 1940560 |
| 2011-09-26 | 2392574 |
| 2011-09-27 | 1714860 |
| 2011-09-28 | 1679588 |
| 2011-09-29 | 1296926 |
| 2011-09-30 | 1812982 |
| 2011-10-03 | 2429644 |
| 2011-10-04 | 2146128 |
| 2011-10-05 | 7027692 |
| 2011-10-06 | 2227490 |
| 2011-10-07 | 2970936 |
| 2011-10-10 | 2234898 |
| 2011-10-11 | 2189086 |
| 2011-10-12 | 2520834 |
| 2011-10-13 | 1543524 |
| 2011-10-14 | 1279438 |
| 2011-10-17 | 1445430 |
| 2011-10-18 | 1867698 |
| 2011-10-19 | 1521008 |
| 2011-10-20 | 1940690 |
| 2011-10-21 | 1354794 |
| 2011-10-24 | 1277074 |
| 2011-10-25 | 2420300 |
| 2011-10-26 | 2382684 |
| 2011-10-27 | 3545490 |
| 2011-10-28 | 1736236 |
| 2011-10-31 | 1807526 |
| 2011-11-01 | 2908712 |
| 2011-11-02 | 2348898 |
| 2011-11-03 | 2057732 |
| 2011-11-04 | 1747016 |
| 2011-11-07 | 1604108 |
| 2011-11-08 | 1028764 |
| 2011-11-09 | 1360792 |
| 2011-11-10 | 1394560 |
| 2011-11-11 | 978654 |
| 2011-11-14 | 942650 |
| 2011-11-15 | 1130498 |
| 2011-11-16 | 1250884 |
| 2011-11-17 | 1089432 |
| 2011-11-18 | 989850 |
| 2011-11-21 | 957724 |
| 2011-11-22 | 894964 |
| 2011-11-23 | 870124 |
| 2011-11-25 | 367742 |
| 2011-11-28 | 1005780 |
| 2011-11-29 | 1063594 |
| 2011-11-30 | 1471586 |
| 2011-12-01 | 1137150 |
| 2011-12-02 | 1463180 |
| 2011-12-05 | 1323588 |
| 2011-12-06 | 1656166 |
| 2011-12-07 | 1001362 |
| 2011-12-08 | 1381268 |
| 2011-12-09 | 970722 |
| 2011-12-12 | 839054 |
| 2011-12-13 | 1266712 |
| 2011-12-14 | 1533196 |
| 2011-12-15 | 1203694 |
| 2011-12-16 | 1862002 |
| 2011-12-19 | 789154 |
| 2011-12-20 | 1678718 |
| 2011-12-21 | 1072974 |
| 2011-12-22 | 562674 |
| 2011-12-23 | 406278 |
| 2011-12-27 | 687146 |
| 2011-12-28 | 954594 |
| 2011-12-29 | 1183766 |
| 2011-12-30 | 864618 |
| 2012-01-03 | 1659418 |
| 2012-01-04 | 1657336 |
| 2012-01-05 | 1574700 |
| 2012-01-06 | 5620298 |
| 2012-01-09 | 2574142 |
| 2012-01-10 | 1543694 |
| 2012-01-11 | 1206680 |
| 2012-01-12 | 1681492 |
| 2012-01-13 | 2377770 |
| 2012-01-17 | 1176194 |
| 2012-01-18 | 912722 |
| 2012-01-19 | 1923780 |
| 2012-01-20 | 1442364 |
| 2012-01-23 | 2039300 |
| 2012-01-24 | 2060228 |
| 2012-01-25 | 1878480 |
| 2012-01-26 | 1783164 |
| 2012-01-27 | 1759070 |
| 2012-01-30 | 1637138 |
| 2012-01-31 | 1045250 |
| 2012-02-01 | 2145812 |
| 2012-02-02 | 2008030 |
| 2012-02-03 | 1395432 |
| 2012-02-06 | 653412 |
| 2012-02-07 | 770646 |
| 2012-02-08 | 1811680 |
| 2012-02-09 | 1341568 |
| 2012-02-10 | 1615284 |
| 2012-02-13 | 1318812 |
| 2012-02-14 | 1332200 |
| 2012-02-15 | 1152094 |
| 2012-02-16 | 744856 |
| 2012-02-17 | 482058 |
| 2012-02-21 | 584900 |
| 2012-02-22 | 712788 |
| 2012-02-23 | 608150 |
| 2012-02-24 | 908454 |
| 2012-02-27 | 999590 |
| 2012-02-28 | 722412 |
| 2012-02-29 | 1310252 |
| 2012-03-01 | 564324 |
| 2012-03-02 | 1049902 |
| 2012-03-05 | 1447694 |
| 2012-03-06 | 1136606 |
| 2012-03-07 | 727484 |
| 2012-03-08 | 804488 |
| 2012-03-09 | 1199370 |
| 2012-03-12 | 553662 |
| 2012-03-13 | 1130000 |
| 2012-03-14 | 766528 |
| 2012-03-15 | 655892 |
| 2012-03-16 | 952710 |
| 2012-03-19 | 685142 |
| 2012-03-20 | 841884 |
| 2012-03-21 | 810232 |
| 2012-03-22 | 749962 |
| 2012-03-23 | 611124 |
| 2012-03-26 | 567312 |
| 2012-03-27 | 1291052 |
| 2012-03-28 | 1017558 |
| 2012-03-29 | 896400 |
| 2012-03-30 | 7379992 |
| 2012-04-02 | 16352450 |
| 2012-04-03 | 9435426 |
| 2012-04-04 | 2877972 |
| 2012-04-05 | 2185344 |
| 2012-04-09 | 2635978 |
| 2012-04-10 | 3549922 |
| 2012-04-11 | 2601126 |
| 2012-04-12 | 1924456 |
| 2012-04-13 | 1667216 |
| 2012-04-16 | 1061868 |
| 2012-04-17 | 1923512 |
| 2012-04-18 | 2552076 |
| 2012-04-19 | 2780598 |
| 2012-04-20 | 2269652 |
| 2012-04-23 | 1987060 |
| 2012-04-24 | 1595954 |
| 2012-04-25 | 1127900 |
| 2012-04-26 | 2693890 |
| 2012-04-27 | 2140126 |
| 2012-04-30 | 1531464 |
| 2012-05-01 | 2032190 |
| 2012-05-02 | 1725026 |
| 2012-05-03 | 1756848 |
| 2012-05-04 | 4814448 |
| 2012-05-07 | 2428684 |
| 2012-05-08 | 2924390 |
| 2012-05-09 | 1439408 |
| 2012-05-10 | 1590636 |
| 2012-05-11 | 923846 |
| 2012-05-14 | 1251920 |
| 2012-05-15 | 1157006 |
| 2012-05-16 | 1576362 |
| 2012-05-17 | 1802788 |
| 2012-05-18 | 1164128 |
| 2012-05-21 | 1383680 |
| 2012-05-22 | 1582724 |
| 2012-05-23 | 827748 |
| 2012-05-24 | 1211064 |
| 2012-05-25 | 888450 |
| 2012-05-29 | 1221936 |
| 2012-05-30 | 991132 |
| 2012-05-31 | 1176696 |
| 2012-06-01 | 1406102 |
| 2012-06-04 | 934830 |
| 2012-06-05 | 1088730 |
| 2012-06-06 | 1772978 |
| 2012-06-07 | 978912 |
| 2012-06-08 | 1669130 |
| 2012-06-11 | 671850 |
| 2012-06-12 | 725642 |
| 2012-06-13 | 3869276 |
| 2012-06-14 | 1224228 |
| 2012-06-15 | 1713990 |
| 2012-06-18 | 1152724 |
| 2012-06-19 | 1408370 |
| 2012-06-20 | 1051314 |
| 2012-06-21 | 2177066 |
| 2012-06-22 | 2318192 |
| 2012-06-25 | 1104854 |
| 2012-06-26 | 1926090 |
| 2012-06-27 | 1325252 |
| 2012-06-28 | 1220562 |
| 2012-06-29 | 1919868 |
| 2012-07-02 | 1034606 |
| 2012-07-03 | 565526 |
| 2012-07-05 | 1338180 |
| 2012-07-06 | 1039342 |
| 2012-07-09 | 1427680 |
| 2012-07-10 | 890972 |
| 2012-07-11 | 1254118 |
| 2012-07-12 | 3379580 |
| 2012-07-13 | 1558818 |
| 2012-07-16 | 1706174 |
| 2012-07-17 | 1814188 |
| 2012-07-18 | 1531470 |
| 2012-07-19 | 2574160 |
| 2012-07-20 | 4780162 |
| 2012-07-23 | 2371256 |
| 2012-07-24 | 1723062 |
| 2012-07-25 | 3197480 |
| 2012-07-26 | 2305224 |
| 2012-07-27 | 4897142 |
| 2012-07-30 | 2087646 |
| 2012-07-31 | 2402166 |
| 2012-08-01 | 1425010 |
| 2012-08-02 | 1143074 |
| 2012-08-03 | 885880 |
| 2012-08-06 | 1165042 |
| 2012-08-07 | 1181874 |
| 2012-08-08 | 1881654 |
| 2012-08-09 | 739440 |
| 2012-08-10 | 893534 |
| 2012-08-13 | 2436684 |
| 2012-08-14 | 1858138 |
| 2012-08-15 | 3023292 |
| 2012-08-16 | 2844196 |
| 2012-08-17 | 2092056 |
| 2012-08-20 | 3069714 |
| 2012-08-21 | 2532470 |
| 2012-08-22 | 2681374 |
| 2012-08-23 | 1815084 |
| 2012-08-24 | 2566408 |
| 2012-08-27 | 2393322 |
| 2012-08-28 | 2121504 |
| 2012-08-29 | 1437654 |
| 2012-08-30 | 1141202 |
| 2012-08-31 | 1001480 |
| 2012-09-04 | 1707480 |
| 2012-09-05 | 1303150 |
| 2012-09-06 | 1370604 |
| 2012-09-07 | 1877772 |
| 2012-09-10 | 1769304 |
| 2012-09-11 | 1514422 |
| 2012-09-12 | 825286 |
| 2012-09-13 | 1247626 |
| 2012-09-14 | 1082412 |
| 2012-09-17 | 2280962 |
| 2012-09-18 | 1322540 |
| 2012-09-19 | 1019174 |
| 2012-09-20 | 1176974 |
| 2012-09-21 | 2195742 |
| 2012-09-24 | 1147184 |
| 2012-09-25 | 1857010 |
| 2012-09-26 | 1474192 |
| 2012-09-27 | 1294452 |
| 2012-09-28 | 6518316 |
| 2012-10-01 | 4279580 |
| 2012-10-02 | 2842708 |
| 2012-10-03 | 3377546 |
| 2012-10-04 | 3545116 |
| 2012-10-05 | 1198216 |
| 2012-10-08 | 1175154 |
| 2012-10-09 | 1409468 |
| 2012-10-10 | 1956256 |
| 2012-10-11 | 1942968 |
| 2012-10-12 | 2001730 |
| 2012-10-15 | 888540 |
| 2012-10-16 | 732788 |
| 2012-10-17 | 1338924 |
| 2012-10-18 | 874356 |
| 2012-10-19 | 2161020 |
| 2012-10-22 | 1572728 |
| 2012-10-23 | 1729684 |
| 2012-10-24 | 1633420 |
| 2012-10-25 | 1441382 |
| 2012-10-26 | 1203218 |
| 2012-10-31 | 1745640 |
| 2012-11-01 | 2561776 |
| 2012-11-02 | 1190268 |
| 2012-11-05 | 777192 |
| 2012-11-06 | 1541970 |
| 2012-11-07 | 1427308 |
| 2012-11-08 | 1397852 |
| 2012-11-09 | 1767900 |
| 2012-11-12 | 480544 |
| 2012-11-13 | 1044360 |
| 2012-11-14 | 2264810 |
| 2012-11-15 | 910642 |
| 2012-11-16 | 1459898 |
| 2012-11-19 | 1883656 |
| 2012-11-20 | 1633468 |
| 2012-11-21 | 1203356 |
| 2012-11-23 | 351832 |
| 2012-11-26 | 1633750 |
| 2012-11-27 | 1227200 |
| 2012-11-28 | 2066556 |
| 2012-11-29 | 683310 |
| 2012-11-30 | 884142 |
| 2012-12-03 | 853202 |
| 2012-12-04 | 1101502 |
| 2012-12-05 | 972738 |
| 2012-12-06 | 796922 |
| 2012-12-07 | 536530 |
| 2012-12-10 | 2818470 |
| 2012-12-11 | 1971860 |
| 2012-12-12 | 818172 |
| 2012-12-13 | 519858 |
| 2012-12-14 | 1007524 |
| 2012-12-17 | 805420 |
| 2012-12-18 | 1253126 |
| 2012-12-19 | 940172 |
| 2012-12-20 | 915228 |
| 2012-12-21 | 1835656 |
| 2012-12-24 | 246770 |
| 2012-12-26 | 526498 |
| 2012-12-27 | 668058 |
| 2012-12-28 | 607394 |
| 2012-12-31 | 758856 |
| 2013-01-02 | 1228718 |
| 2013-01-03 | 1754532 |
| 2013-01-04 | 1513428 |
| 2013-01-07 | 1997418 |
| 2013-01-08 | 2137828 |
| 2013-01-09 | 7141538 |
| 2013-01-10 | 2057808 |
| 2013-01-11 | 1030330 |
| 2013-01-14 | 1353276 |
| 2013-01-15 | 1737536 |
| 2013-01-16 | 1698794 |
| 2013-01-17 | 2806690 |
| 2013-01-18 | 1943568 |
| 2013-01-22 | 1091434 |
| 2013-01-23 | 1278536 |
| 2013-01-24 | 2246796 |
| 2013-01-25 | 1035766 |
| 2013-01-28 | 1679462 |
| 2013-01-29 | 1341844 |
| 2013-01-30 | 1197196 |
| 2013-01-31 | 838606 |
| 2013-02-01 | 961476 |
| 2013-02-04 | 964280 |
| 2013-02-05 | 1101698 |
| 2013-02-06 | 814802 |
| 2013-02-07 | 985686 |
| 2013-02-08 | 868196 |
| 2013-02-11 | 917958 |
| 2013-02-12 | 1177270 |
| 2013-02-13 | 1127310 |
| 2013-02-14 | 913392 |
| 2013-02-15 | 972142 |
| 2013-02-19 | 2713356 |
| 2013-02-20 | 1276624 |
| 2013-02-21 | 1321032 |
| 2013-02-22 | 1118784 |
| 2013-02-25 | 914772 |
| 2013-02-26 | 1125596 |
| 2013-02-27 | 1899972 |
| 2013-02-28 | 2576326 |
| 2013-03-01 | 2337856 |
| 2013-03-04 | 1395336 |
| 2013-03-05 | 1066004 |
| 2013-03-06 | 1570938 |
| 2013-03-07 | 2215878 |
| 2013-03-08 | 1134128 |
| 2013-03-11 | 782468 |
| 2013-03-12 | 1467614 |
| 2013-03-13 | 1619580 |
| 2013-03-14 | 753372 |
| 2013-03-15 | 2527512 |
| 2013-03-18 | 1268430 |
| 2013-03-19 | 1024018 |
| 2013-03-20 | 752296 |
| 2013-03-21 | 1489372 |
| 2013-03-22 | 1183908 |
| 2013-03-25 | 944068 |
| 2013-03-26 | 1146966 |
| 2013-03-27 | 1285000 |
| 2013-03-28 | 1399224 |
| 2013-04-01 | 1740960 |
| 2013-04-02 | 1632428 |
| 2013-04-03 | 10833060 |
| 2013-04-04 | 3159710 |
| 2013-04-05 | 2446732 |
| 2013-04-08 | 2112858 |
| 2013-04-09 | 2795330 |
| 2013-04-10 | 1607356 |
| 2013-04-11 | 1248516 |
| 2013-04-12 | 1147322 |
| 2013-04-15 | 1676558 |
| 2013-04-16 | 1449348 |
| 2013-04-17 | 1752582 |
| 2013-04-18 | 1869730 |
| 2013-04-19 | 1919264 |
| 2013-04-22 | 1395100 |
| 2013-04-23 | 1660892 |
| 2013-04-24 | 1611610 |
| 2013-04-25 | 836948 |
| 2013-04-26 | 1081310 |
| 2013-04-29 | 1200898 |
| 2013-04-30 | 1878212 |
| 2013-05-01 | 1957840 |
| 2013-05-02 | 1335180 |
| 2013-05-03 | 1595508 |
| 2013-05-06 | 1964876 |
| 2013-05-07 | 1672490 |
| 2013-05-08 | 939158 |
| 2013-05-09 | 713676 |
| 2013-05-10 | 986042 |
| 2013-05-13 | 1083978 |
| 2013-05-14 | 900662 |
| 2013-05-15 | 1926530 |
| 2013-05-16 | 2076422 |
| 2013-05-17 | 1534638 |
| 2013-05-20 | 1340084 |
| 2013-05-21 | 1678580 |
| 2013-05-22 | 1510590 |
| 2013-05-23 | 2289982 |
| 2013-05-24 | 1018148 |
| 2013-05-28 | 1065626 |
| 2013-05-29 | 2516750 |
| 2013-05-30 | 1855684 |
| 2013-05-31 | 1336694 |
| 2013-06-03 | 1652548 |
| 2013-06-04 | 1717224 |
| 2013-06-05 | 1518806 |
| 2013-06-06 | 1271076 |
| 2013-06-07 | 1509930 |
| 2013-06-10 | 1384160 |
| 2013-06-11 | 1910014 |
| 2013-06-12 | 1220180 |
| 2013-06-13 | 1844162 |
| 2013-06-14 | 1255428 |
| 2013-06-17 | 1066136 |
| 2013-06-18 | 886730 |
| 2013-06-19 | 1234300 |
| 2013-06-20 | 904592 |
| 2013-06-21 | 2998654 |
| 2013-06-24 | 1999764 |
| 2013-06-25 | 874718 |
| 2013-06-26 | 761328 |
| 2013-06-27 | 822878 |
| 2013-06-28 | 2361562 |
| 2013-07-01 | 1386302 |
| 2013-07-02 | 1198126 |
| 2013-07-03 | 826332 |
| 2013-07-05 | 912534 |
| 2013-07-08 | 1432402 |
| 2013-07-09 | 1445544 |
| 2013-07-10 | 1473262 |
| 2013-07-11 | 1285244 |
| 2013-07-12 | 977380 |
| 2013-07-15 | 867110 |
| 2013-07-16 | 932856 |
| 2013-07-17 | 1965006 |
| 2013-07-18 | 1309916 |
| 2013-07-19 | 1399958 |
| 2013-07-22 | 1592474 |
| 2013-07-23 | 1675664 |
| 2013-07-24 | 2658470 |
| 2013-07-25 | 2784094 |
| 2013-07-26 | 6855358 |
| 2013-07-29 | 2563936 |
| 2013-07-30 | 1755184 |
| 2013-07-31 | 2056458 |
| 2013-08-01 | 3561984 |
| 2013-08-02 | 1150344 |
| 2013-08-05 | 623186 |
| 2013-08-06 | 1025812 |
| 2013-08-07 | 1092300 |
| 2013-08-08 | 1177006 |
| 2013-08-09 | 544672 |
| 2013-08-12 | 637360 |
| 2013-08-13 | 1275670 |
| 2013-08-14 | 1978446 |
| 2013-08-15 | 1317166 |
| 2013-08-16 | 1159248 |
| 2013-08-19 | 1500628 |
| 2013-08-20 | 1199704 |
| 2013-08-21 | 1012726 |
| 2013-08-22 | 519896 |
| 2013-08-23 | 754016 |
| 2013-08-26 | 980176 |
| 2013-08-27 | 673536 |
| 2013-08-28 | 537978 |
| 2013-08-29 | 1012470 |
| 2013-08-30 | 880122 |
| 2013-09-03 | 3013860 |
| 2013-09-04 | 573724 |
| 2013-09-05 | 912162 |
| 2013-09-06 | 760714 |
| 2013-09-09 | 738096 |
| 2013-09-10 | 746370 |
| 2013-09-11 | 631284 |
| 2013-09-12 | 516090 |
| 2013-09-13 | 597360 |
| 2013-09-16 | 1064418 |
| 2013-09-17 | 947300 |
| 2013-09-18 | 935060 |
| 2013-09-19 | 698844 |
| 2013-09-20 | 1847184 |
| 2013-09-23 | 910452 |
| 2013-09-24 | 711914 |
| 2013-09-25 | 1045806 |
| 2013-09-26 | 960286 |
| 2013-09-27 | 1668216 |
| 2013-09-30 | 2399738 |
| 2013-10-01 | 4146260 |
| 2013-10-02 | 16313228 |
| 2013-10-03 | 3882284 |
| 2013-10-04 | 1867530 |
| 2013-10-07 | 2888440 |
| 2013-10-08 | 2663852 |
| 2013-10-09 | 2291948 |
| 2013-10-10 | 1580012 |
| 2013-10-11 | 979754 |
| 2013-10-14 | 1089826 |
| 2013-10-15 | 1495438 |
| 2013-10-16 | 1847748 |
| 2013-10-17 | 1030198 |
| 2013-10-18 | 1354398 |
| 2013-10-21 | 1376580 |
| 2013-10-22 | 2886968 |
| 2013-10-23 | 2143512 |
| 2013-10-24 | 2306452 |
| 2013-10-25 | 1818776 |
| 2013-10-28 | 1625358 |
| 2013-10-29 | 2394734 |
| 2013-10-30 | 1289308 |
| 2013-10-31 | 1585812 |
| 2013-11-01 | 1206178 |
| 2013-11-04 | 1155854 |
| 2013-11-05 | 1447638 |
| 2013-11-06 | 1175636 |
| 2013-11-07 | 1773566 |
| 2013-11-08 | 1007046 |
| 2013-11-11 | 697684 |
| 2013-11-12 | 1063872 |
| 2013-11-13 | 1646620 |
| 2013-11-14 | 2273092 |
| 2013-11-15 | 904600 |
| 2013-11-18 | 1463296 |
| 2013-11-19 | 1528810 |
| 2013-11-20 | 1009750 |
| 2013-11-21 | 900280 |
| 2013-11-22 | 992488 |
| 2013-11-25 | 1551866 |
| 2013-11-26 | 970928 |
| 2013-11-27 | 1629420 |
| 2013-11-29 | 428324 |
| 2013-12-02 | 1185336 |
| 2013-12-03 | 1305076 |
| 2013-12-04 | 955220 |
| 2013-12-05 | 1051656 |
| 2013-12-06 | 1071440 |
| 2013-12-09 | 1087760 |
| 2013-12-10 | 902394 |
| 2013-12-11 | 1116680 |
| 2013-12-12 | 1104612 |
| 2013-12-13 | 741962 |
| 2013-12-16 | 1073028 |
| 2013-12-17 | 974088 |
| 2013-12-18 | 1844296 |
| 2013-12-19 | 1739228 |
| 2013-12-20 | 2247876 |
| 2013-12-23 | 1164356 |
| 2013-12-24 | 606760 |
| 2013-12-26 | 1259540 |
| 2013-12-27 | 611888 |
| 2013-12-30 | 657694 |
| 2013-12-31 | 518732 |
| 2014-01-02 | 1658578 |
| 2014-01-03 | 2058802 |
| 2014-01-06 | 2298184 |
| 2014-01-07 | 2357630 |
| 2014-01-08 | 3408800 |
| 2014-01-09 | 7755664 |
| 2014-01-10 | 3014998 |
| 2014-01-13 | 2890502 |
| 2014-01-14 | 1885144 |
| 2014-01-15 | 1007174 |
| 2014-01-16 | 1046662 |
| 2014-01-17 | 892068 |
| 2014-01-21 | 1477194 |
| 2014-01-22 | 1315438 |
| 2014-01-23 | 1195790 |
| 2014-01-24 | 2492034 |
| 2014-01-27 | 1594062 |
| 2014-01-28 | 1965730 |
| 2014-01-29 | 1140496 |
| 2014-01-30 | 1033580 |
| 2014-01-31 | 2056450 |
| 2014-02-03 | 2508546 |
| 2014-02-04 | 1592304 |
| 2014-02-05 | 1648642 |
| 2014-02-06 | 836168 |
| 2014-02-07 | 1132486 |
| 2014-02-10 | 1020318 |
| 2014-02-11 | 1325392 |
| 2014-02-12 | 806678 |
| 2014-02-13 | 867820 |
| 2014-02-14 | 912176 |
| 2014-02-18 | 1294436 |
| 2014-02-19 | 1372960 |
| 2014-02-20 | 1028408 |
| 2014-02-21 | 1279756 |
| 2014-02-24 | 1115734 |
| 2014-02-25 | 952914 |
| 2014-02-26 | 764292 |
| 2014-02-27 | 1262118 |
| 2014-02-28 | 1337062 |
| 2014-03-03 | 1245972 |
| 2014-03-04 | 1183028 |
| 2014-03-05 | 1076662 |
| 2014-03-06 | 1848962 |
| 2014-03-07 | 1627128 |
| 2014-03-10 | 1296840 |
| 2014-03-11 | 916988 |
| 2014-03-12 | 933116 |
| 2014-03-13 | 1146138 |
| 2014-03-14 | 1306026 |
| 2014-03-17 | 809754 |
| 2014-03-18 | 880524 |
| 2014-03-19 | 966430 |
| 2014-03-20 | 765554 |
| 2014-03-21 | 2567202 |
| 2014-03-24 | 841420 |
| 2014-03-25 | 1750434 |
| 2014-03-26 | 1756726 |
| 2014-03-27 | 1937434 |
| 2014-03-28 | 1144738 |
| 2014-03-31 | 784570 |
| 2014-04-01 | 1592180 |
| 2014-04-02 | 1368738 |
| 2014-04-03 | 1951398 |
| 2014-04-04 | 6742472 |
| 2014-04-07 | 3498704 |
| 2014-04-08 | 2279446 |
| 2014-04-09 | 1576616 |
| 2014-04-10 | 2057190 |
| 2014-04-11 | 1795406 |
| 2014-04-14 | 1866176 |
| 2014-04-15 | 1610668 |
| 2014-04-16 | 1369800 |
| 2014-04-17 | 1131564 |
| 2014-04-21 | 1306200 |
| 2014-04-22 | 1780900 |
| 2014-04-23 | 1930802 |
| 2014-04-24 | 2596622 |
| 2014-04-25 | 1506916 |
| 2014-04-28 | 1620012 |
| 2014-04-29 | 2445888 |
| 2014-04-30 | 1360210 |
| 2014-05-01 | 1733386 |
| 2014-05-02 | 1520986 |
| 2014-05-05 | 1275048 |
| 2014-05-06 | 1479090 |
| 2014-05-07 | 1314058 |
| 2014-05-08 | 1838970 |
| 2014-05-09 | 1939688 |
| 2014-05-12 | 2189874 |
| 2014-05-13 | 3085950 |
| 2014-05-14 | 1502050 |
| 2014-05-15 | 1482028 |
| 2014-05-16 | 1684596 |
| 2014-05-19 | 1415154 |
| 2014-05-20 | 1127466 |
| 2014-05-21 | 1527926 |
| 2014-05-22 | 1269782 |
| 2014-05-23 | 1169360 |
| 2014-05-27 | 895908 |
| 2014-05-28 | 1204256 |
| 2014-05-29 | 1064550 |
| 2014-05-30 | 1269558 |
| 2014-06-02 | 1044592 |
| 2014-06-03 | 1318116 |
| 2014-06-04 | 689864 |
| 2014-06-05 | 1198602 |
| 2014-06-06 | 1505970 |
| 2014-06-09 | 1082862 |
| 2014-06-10 | 1317748 |
| 2014-06-11 | 744868 |
| 2014-06-12 | 1038774 |
| 2014-06-13 | 1266716 |
| 2014-06-16 | 1142332 |
| 2014-06-17 | 1645146 |
| 2014-06-18 | 1495936 |
| 2014-06-19 | 1270268 |
| 2014-06-20 | 1864350 |
| 2014-06-23 | 905778 |
| 2014-06-24 | 1069014 |
| 2014-06-25 | 584632 |
| 2014-06-26 | 470804 |
| 2014-06-27 | 645240 |
| 2014-06-30 | 840416 |
| 2014-07-01 | 1422316 |
| 2014-07-02 | 654490 |
| 2014-07-03 | 686704 |
| 2014-07-07 | 744646 |
| 2014-07-08 | 776880 |
| 2014-07-09 | 616436 |
| 2014-07-10 | 682684 |
| 2014-07-11 | 702552 |
| 2014-07-14 | 557606 |
| 2014-07-15 | 898198 |
| 2014-07-16 | 859378 |
| 2014-07-17 | 1090300 |
| 2014-07-18 | 1095934 |
| 2014-07-21 | 707132 |
| 2014-07-22 | 875148 |
| 2014-07-23 | 445904 |
| 2014-07-24 | 1344074 |
| 2014-07-25 | 1248632 |
| 2014-07-28 | 1485750 |
| 2014-07-29 | 1865482 |
| 2014-07-30 | 3754772 |
| 2014-07-31 | 2187518 |
| 2014-08-01 | 1756980 |
| 2014-08-04 | 1366396 |
| 2014-08-05 | 1575052 |
| 2014-08-06 | 1431760 |
| 2014-08-07 | 1907180 |
| 2014-08-08 | 2594360 |
| 2014-08-11 | 973432 |
| 2014-08-12 | 786766 |
| 2014-08-13 | 2211184 |
| 2014-08-14 | 1111448 |
| 2014-08-15 | 1264578 |
| 2014-08-18 | 644472 |
| 2014-08-19 | 681442 |
| 2014-08-20 | 748390 |
| 2014-08-21 | 636128 |
| 2014-08-22 | 535578 |
| 2014-08-25 | 496900 |
| 2014-08-26 | 446666 |
| 2014-08-27 | 740528 |
| 2014-08-28 | 552756 |
| 2014-08-29 | 717862 |
| 2014-09-02 | 1445872 |
| 2014-09-03 | 1054042 |
| 2014-09-04 | 1137810 |
| 2014-09-05 | 391296 |
| 2014-09-08 | 392066 |
| 2014-09-09 | 1793222 |
| 2014-09-10 | 1048444 |
| 2014-09-11 | 886916 |
| 2014-09-12 | 997246 |
| 2014-09-15 | 1058262 |
| 2014-09-16 | 1325590 |
| 2014-09-17 | 655388 |
| 2014-09-18 | 799854 |
| 2014-09-19 | 1965074 |
| 2014-09-22 | 787682 |
| 2014-09-23 | 924408 |
| 2014-09-24 | 1316168 |
| 2014-09-25 | 1697458 |
| 2014-09-26 | 1502380 |
| 2014-09-29 | 1263266 |
| 2014-09-30 | 1888686 |
| 2014-10-01 | 2336104 |
| 2014-10-02 | 3865346 |
| 2014-10-03 | 4146856 |
| 2014-10-06 | 3607682 |
| 2014-10-07 | 1685738 |
| 2014-10-08 | 1975914 |
| 2014-10-09 | 1707142 |
| 2014-10-10 | 2062534 |
| 2014-10-13 | 2170428 |
| 2014-10-14 | 2189322 |
| 2014-10-15 | 2539514 |
| 2014-10-16 | 1852464 |
| 2014-10-17 | 1838602 |
| 2014-10-20 | 1105196 |
| 2014-10-21 | 1665590 |
| 2014-10-22 | 2518590 |
| 2014-10-23 | 1023052 |
| 2014-10-24 | 848470 |
| 2014-10-27 | 1279572 |
| 2014-10-28 | 692468 |
| 2014-10-29 | 1248020 |
| 2014-10-30 | 1149982 |
| 2014-10-31 | 1484476 |
| 2014-11-03 | 1048976 |
| 2014-11-04 | 1834608 |
| 2014-11-05 | 1701838 |
| 2014-11-06 | 1292480 |
| 2014-11-07 | 1099774 |
| 2014-11-10 | 1376620 |
| 2014-11-11 | 664700 |
| 2014-11-12 | 681774 |
| 2014-11-13 | 1296242 |
| 2014-11-14 | 964778 |
| 2014-11-17 | 669688 |
| 2014-11-18 | 739470 |
| 2014-11-19 | 700376 |
| 2014-11-20 | 662794 |
| 2014-11-21 | 601574 |
| 2014-11-24 | 1095540 |
| 2014-11-25 | 872408 |
| 2014-11-26 | 441668 |
| 2014-11-28 | 531944 |
| 2014-12-01 | 1678542 |
| 2014-12-02 | 814036 |
| 2014-12-03 | 655566 |
| 2014-12-04 | 819154 |
| 2014-12-05 | 593024 |
| 2014-12-08 | 1318292 |
| 2014-12-09 | 699370 |
| 2014-12-10 | 1238082 |
| 2014-12-11 | 798138 |
| 2014-12-12 | 1536018 |
| 2014-12-15 | 1589234 |
| 2014-12-16 | 1170716 |
| 2014-12-17 | 1587344 |
| 2014-12-18 | 1114382 |
| 2014-12-19 | 2050462 |
| 2014-12-22 | 926944 |
| 2014-12-23 | 645454 |
| 2014-12-24 | 254236 |
| 2014-12-26 | 455728 |
| 2014-12-29 | 579272 |
| 2014-12-30 | 679004 |
| 2014-12-31 | 627274 |
| 2015-01-02 | 497654 |
| 2015-01-05 | 1174328 |
| 2015-01-06 | 1719882 |
| 2015-01-07 | 1795584 |
| 2015-01-08 | 3869210 |
| 2015-01-09 | 2463968 |
| 2015-01-12 | 1209628 |
| 2015-01-13 | 1534290 |
| 2015-01-14 | 1462928 |
| 2015-01-15 | 2359844 |
| 2015-01-16 | 1977384 |
| 2015-01-20 | 1318846 |
| 2015-01-21 | 1089512 |
| 2015-01-22 | 1023292 |
| 2015-01-23 | 1227832 |
| 2015-01-26 | 1061558 |
| 2015-01-27 | 1560242 |
| 2015-01-28 | 1760726 |
| 2015-01-29 | 926420 |
| 2015-01-30 | 1606568 |
| 2015-02-02 | 1256036 |
| 2015-02-03 | 857084 |
| 2015-02-04 | 745222 |
| 2015-02-05 | 967574 |
| 2015-02-06 | 853052 |
| 2015-02-09 | 541830 |
| 2015-02-10 | 793338 |
| 2015-02-11 | 532938 |
| 2015-02-12 | 729200 |
| 2015-02-13 | 919466 |
| 2015-02-17 | 630858 |
| 2015-02-18 | 692668 |
| 2015-02-19 | 355380 |
| 2015-02-20 | 737056 |
| 2015-02-23 | 517628 |
| 2015-02-24 | 978322 |
| 2015-02-25 | 745450 |
| 2015-02-26 | 796382 |
| 2015-02-27 | 746140 |
| 2015-03-02 | 747468 |
| 2015-03-03 | 661260 |
| 2015-03-04 | 460358 |
| 2015-03-05 | 492876 |
| 2015-03-06 | 854180 |
| 2015-03-09 | 808402 |
| 2015-03-10 | 1001400 |
| 2015-03-11 | 1056636 |
| 2015-03-12 | 821044 |
| 2015-03-13 | 784426 |
| 2015-03-16 | 999994 |
| 2015-03-17 | 933108 |
| 2015-03-18 | 1235916 |
| 2015-03-19 | 1125158 |
| 2015-03-20 | 1676934 |
| 2015-03-23 | 736008 |
| 2015-03-24 | 1293180 |
| 2015-03-25 | 1916046 |
| 2015-03-26 | 1714386 |
| 2015-03-27 | 941252 |
| 2015-03-30 | 1404302 |
| 2015-03-31 | 844316 |
| 2015-04-01 | 867014 |
| 2015-04-02 | 699660 |
| 2015-04-06 | 1856914 |
| 2015-04-07 | 2124888 |
| 2015-04-08 | 4480390 |
| 2015-04-09 | 2522960 |
| 2015-04-10 | 1566256 |
| 2015-04-13 | 1311672 |
| 2015-04-14 | 1074336 |
| 2015-04-15 | 1828956 |
| 2015-04-16 | 1219712 |
| 2015-04-17 | 2331736 |
| 2015-04-20 | 1603886 |
| 2015-04-21 | 1231858 |
| 2015-04-22 | 939790 |
| 2015-04-23 | 671618 |
| 2015-04-24 | 705146 |
| 2015-04-27 | 551346 |
| 2015-04-28 | 1044780 |
| 2015-04-29 | 874944 |
| 2015-04-30 | 1293882 |
| 2015-05-01 | 750796 |
| 2015-05-04 | 718496 |
| 2015-05-05 | 1113440 |
| 2015-05-06 | 1109870 |
| 2015-05-07 | 1009862 |
| 2015-05-08 | 1212058 |
| 2015-05-11 | 820982 |
| 2015-05-12 | 904308 |
| 2015-05-13 | 1001468 |
| 2015-05-14 | 1378872 |
| 2015-05-15 | 1224138 |
| 2015-05-18 | 1232824 |
| 2015-05-19 | 1333892 |
| 2015-05-20 | 1703636 |
| 2015-05-21 | 1320874 |
| 2015-05-22 | 696258 |
| 2015-05-26 | 928714 |
| 2015-05-27 | 1157938 |
| 2015-05-28 | 889872 |
| 2015-05-29 | 1300276 |
| 2015-06-01 | 1118434 |
| 2015-06-02 | 1279276 |
| 2015-06-03 | 1310662 |
| 2015-06-04 | 697286 |
| 2015-06-05 | 838364 |
| 2015-06-08 | 772330 |
| 2015-06-09 | 755174 |
| 2015-06-10 | 784598 |
| 2015-06-11 | 907108 |
| 2015-06-12 | 777948 |
| 2015-06-15 | 1147322 |
| 2015-06-16 | 1007706 |
| 2015-06-17 | 539998 |
| 2015-06-18 | 920144 |
| 2015-06-19 | 1110848 |
| 2015-06-22 | 517502 |
| 2015-06-23 | 604280 |
| 2015-06-24 | 636992 |
| 2015-06-25 | 693186 |
| 2015-06-26 | 975872 |
| 2015-06-29 | 981354 |
| 2015-06-30 | 1697808 |
| 2015-07-01 | 1124044 |
| 2015-07-02 | 670544 |
| 2015-07-06 | 596236 |
| 2015-07-07 | 1472220 |
| 2015-07-08 | 1002070 |
| 2015-07-09 | 706258 |
| 2015-07-10 | 581990 |
| 2015-07-13 | 597558 |
| 2015-07-14 | 414556 |
| 2015-07-15 | 509552 |
| 2015-07-16 | 1045602 |
| 2015-07-17 | 562134 |
| 2015-07-20 | 1596942 |
| 2015-07-21 | 627100 |
| 2015-07-22 | 895500 |
| 2015-07-23 | 755258 |
| 2015-07-24 | 917072 |
| 2015-07-27 | 1621196 |
| 2015-07-28 | 3883708 |
| 2015-07-29 | 3327214 |
| 2015-07-30 | 1669088 |
| 2015-07-31 | 1850814 |
| 2015-08-03 | 1168610 |
| 2015-08-04 | 851960 |
| 2015-08-05 | 1087608 |
| 2015-08-06 | 984808 |
| 2015-08-07 | 719604 |
| 2015-08-10 | 850724 |
| 2015-08-11 | 705810 |
| 2015-08-12 | 712964 |
| 2015-08-13 | 964440 |
| 2015-08-14 | 1155396 |
| 2015-08-17 | 654836 |
| 2015-08-18 | 1168376 |
| 2015-08-19 | 786110 |
| 2015-08-20 | 1036068 |
| 2015-08-21 | 1786980 |
| 2015-08-24 | 2252418 |
| 2015-08-25 | 1545152 |
| 2015-08-26 | 1157276 |
| 2015-08-27 | 689696 |
| 2015-08-28 | 755576 |
| 2015-08-31 | 709646 |
| 2015-09-01 | 729192 |
| 2015-09-02 | 633814 |
| 2015-09-03 | 778654 |
| 2015-09-04 | 720222 |
| 2015-09-08 | 882972 |
| 2015-09-09 | 831896 |
| 2015-09-10 | 761186 |
| 2015-09-11 | 664488 |
| 2015-09-14 | 1011152 |
| 2015-09-15 | 746588 |
| 2015-09-16 | 837952 |
| 2015-09-17 | 840046 |
| 2015-09-18 | 1702254 |
| 2015-09-21 | 1016706 |
| 2015-09-22 | 1162252 |
| 2015-09-23 | 773248 |
| 2015-09-24 | 1033178 |
| 2015-09-25 | 743508 |
| 2015-09-28 | 1184018 |
| 2015-09-29 | 1399372 |
| 2015-09-30 | 1111382 |
| 2015-10-01 | 1499022 |
| 2015-10-02 | 1316110 |
| 2015-10-05 | 2030812 |
| 2015-10-06 | 2174856 |
| 2015-10-07 | 4551480 |
| 2015-10-08 | 3499520 |
| 2015-10-09 | 2030070 |
| 2015-10-12 | 2040880 |
| 2015-10-13 | 2920150 |
| 2015-10-14 | 3516296 |
| 2015-10-15 | 2190742 |
| 2015-10-16 | 1256364 |
| 2015-10-19 | 2596268 |
| 2015-10-20 | 2389170 |
| 2015-10-21 | 2204798 |
| 2015-10-22 | 2053418 |
| 2015-10-23 | 1339204 |
| 2015-10-26 | 1236908 |
| 2015-10-27 | 2157418 |
| 2015-10-28 | 3125164 |
| 2015-10-29 | 1798670 |
| 2015-10-30 | 1166468 |
| 2015-11-02 | 1199052 |
| 2015-11-03 | 988809 |
| 2015-11-04 | 895129 |
| 2015-11-05 | 820634 |
| 2015-11-06 | 1089024 |
| 2015-11-09 | 1444224 |
| 2015-11-10 | 1595393 |
| 2015-11-11 | 1137173 |
| 2015-11-12 | 1063424 |
| 2015-11-13 | 1332381 |
| 2015-11-16 | 860061 |
| 2015-11-17 | 1160969 |
| 2015-11-18 | 1282922 |
| 2015-11-19 | 1220250 |
| 2015-11-20 | 1067748 |
| 2015-11-23 | 1298790 |
| 2015-11-24 | 1374092 |
| 2015-11-25 | 790177 |
| 2015-11-27 | 697442 |
| 2015-11-30 | 6490938 |
| 2015-12-01 | 1559213 |
| 2015-12-02 | 1172476 |
| 2015-12-03 | 1556715 |
| 2015-12-04 | 1007103 |
| 2015-12-07 | 891883 |
| 2015-12-08 | 864854 |
| 2015-12-09 | 1140322 |
| 2015-12-10 | 4018625 |
| 2015-12-11 | 2380681 |
| 2015-12-14 | 1650072 |
| 2015-12-15 | 1392445 |
| 2015-12-16 | 12820350 |
| 2015-12-17 | 4173245 |
| 2015-12-18 | 5840822 |
| 2015-12-21 | 2003680 |
| 2015-12-22 | 1734633 |
| 2015-12-23 | 1079629 |
| 2015-12-24 | 609579 |
| 2015-12-28 | 1118741 |
| 2015-12-29 | 955672 |
| 2015-12-30 | 1048245 |
| 2015-12-31 | 1361747 |
| 2016-01-04 | 2681572 |
| 2016-01-05 | 2400636 |
| 2016-01-06 | 2911308 |
| 2016-01-07 | 2342902 |
| 2016-01-08 | 1870750 |
| 2016-01-11 | 2906506 |
| 2016-01-12 | 3306692 |
| 2016-01-13 | 3665845 |
| 2016-01-14 | 1955359 |
| 2016-01-15 | 3345622 |
| 2016-01-19 | 2621678 |
| 2016-01-20 | 3481267 |
| 2016-01-21 | 2451736 |
| 2016-01-22 | 1882834 |
| 2016-01-25 | 2309244 |
| 2016-01-26 | 2498669 |
| 2016-01-27 | 2719978 |
| 2016-01-28 | 1862763 |
| 2016-01-29 | 2532525 |
| 2016-02-01 | 1888809 |
| 2016-02-02 | 1963848 |
| 2016-02-03 | 1970151 |
| 2016-02-04 | 1055741 |
| 2016-02-05 | 1276052 |
| 2016-02-08 | 2274644 |
| 2016-02-09 | 1800789 |
| 2016-02-10 | 2673116 |
| 2016-02-11 | 2132484 |
| 2016-02-12 | 1962274 |
| 2016-02-16 | 1391513 |
| 2016-02-17 | 1654691 |
| 2016-02-18 | 1574782 |
| 2016-02-19 | 1564899 |
| 2016-02-22 | 1466393 |
| 2016-02-23 | 1264694 |
| 2016-02-24 | 1086099 |
| 2016-02-25 | 967713 |
| 2016-02-26 | 1031912 |
| 2016-02-29 | 1415790 |
| 2016-03-01 | 1019240 |
| 2016-03-02 | 869985 |
| 2016-03-03 | 991664 |
| 2016-03-04 | 1375480 |
| 2016-03-07 | 2221987 |
| 2016-03-08 | 2560940 |
| 2016-03-09 | 1153389 |
| 2016-03-10 | 1400238 |
| 2016-03-11 | 1216665 |
| 2016-03-14 | 1550566 |
| 2016-03-15 | 1967804 |
| 2016-03-16 | 1392039 |
| 2016-03-17 | 1551027 |
| 2016-03-18 | 1734076 |
| 2016-03-21 | 1098893 |
| 2016-03-22 | 1547818 |
| 2016-03-23 | 1940678 |
| 2016-03-24 | 1368216 |
| 2016-03-28 | 1009243 |
| 2016-03-29 | 3429496 |
| 2016-03-30 | 1203217 |
| 2016-03-31 | 2422054 |
| 2016-04-01 | 1353216 |
| 2016-04-04 | 1729666 |
| 2016-04-05 | 1878634 |
| 2016-04-06 | 4605326 |
| 2016-04-07 | 3256806 |
| 2016-04-08 | 1493454 |
| 2016-04-11 | 2059290 |
| 2016-04-12 | 2693917 |
| 2016-04-13 | 2966857 |
| 2016-04-14 | 2630266 |
| 2016-04-15 | 1584227 |
| 2016-04-18 | 1719055 |
| 2016-04-19 | 2079566 |
| 2016-04-20 | 4520468 |
| 2016-04-21 | 2818527 |
| 2016-04-22 | 36730000 |
| 2016-04-25 | 2359589 |
| 2016-04-26 | 2328937 |
| 2016-04-27 | 2841021 |
| 2016-04-28 | 1525930 |
| 2016-04-29 | 2355872 |
| 2016-05-02 | 1485512 |
| 2016-05-03 | 1718935 |
| 2016-05-04 | 1599083 |
| 2016-05-05 | 1296230 |
| 2016-05-06 | 1429416 |
| 2016-05-09 | 1433051 |
| 2016-05-10 | 1538689 |
| 2016-05-11 | 1340067 |
| 2016-05-12 | 1297190 |
| 2016-05-13 | 1260631 |
| 2016-05-16 | 1080383 |
| 2016-05-17 | 1625243 |
| 2016-05-18 | 1037161 |
| 2016-05-19 | 986246 |
| 2016-05-20 | 902749 |
| 2016-05-23 | 886516 |
| 2016-05-24 | 1846365 |
| 2016-05-25 | 1372718 |
| 2016-05-26 | 642100 |
| 2016-05-27 | 718377 |
| 2016-05-31 | 1878342 |
| 2016-06-01 | 1411938 |
| 2016-06-02 | 1479891 |
| 2016-06-03 | 2566088 |
| 2016-06-06 | 1541868 |
| 2016-06-07 | 1023602 |
| 2016-06-08 | 1738052 |
| 2016-06-09 | 693460 |
| 2016-06-10 | 1083449 |
| 2016-06-13 | 1583123 |
| 2016-06-14 | 1104070 |
| 2016-06-15 | 1489192 |
| 2016-06-16 | 1062647 |
| 2016-06-17 | 1141010 |
| 2016-06-20 | 1114174 |
| 2016-06-21 | 967269 |
| 2016-06-22 | 1110814 |
| 2016-06-23 | 1002770 |
| 2016-06-24 | 2952634 |
| 2016-06-27 | 3280760 |
| 2016-06-28 | 1840511 |
| 2016-06-29 | 1175062 |
| 2016-06-30 | 1572407 |
| 2016-07-01 | 946572 |
| 2016-07-05 | 1668883 |
| 2016-07-06 | 1099068 |
| 2016-07-07 | 955704 |
| 2016-07-08 | 1013422 |
| 2016-07-11 | 1495839 |
| 2016-07-12 | 1195236 |
| 2016-07-13 | 925932 |
| 2016-07-14 | 861960 |
| 2016-07-15 | 816897 |
| 2016-07-18 | 682642 |
| 2016-07-19 | 602752 |
| 2016-07-20 | 768439 |
| 2016-07-21 | 665400 |
| 2016-07-22 | 563407 |
| 2016-07-25 | 1075868 |
| 2016-07-26 | 1298898 |
| 2016-07-27 | 2115829 |
| 2016-07-28 | 2681295 |
| 2016-07-29 | 2679387 |
| 2016-08-01 | 1962830 |
| 2016-08-02 | 2717745 |
| 2016-08-03 | 1840734 |
| 2016-08-04 | 1378262 |
| 2016-08-05 | 1411243 |
| 2016-08-08 | 980316 |
| 2016-08-09 | 2048666 |
| 2016-08-10 | 924662 |
| 2016-08-11 | 993836 |
| 2016-08-12 | 572341 |
| 2016-08-15 | 850919 |
| 2016-08-16 | 966586 |
| 2016-08-17 | 1072362 |
| 2016-08-18 | 927493 |
| 2016-08-19 | 1048491 |
| 2016-08-22 | 1096444 |
| 2016-08-23 | 1095956 |
| 2016-08-24 | 793110 |
| 2016-08-25 | 973697 |
| 2016-08-26 | 1030254 |
| 2016-08-29 | 958322 |
| 2016-08-30 | 913438 |
| 2016-08-31 | 1051723 |
| 2016-09-01 | 1562074 |
| 2016-09-02 | 1550133 |
| 2016-09-06 | 1420599 |
| 2016-09-07 | 1705724 |
| 2016-09-08 | 1701972 |
| 2016-09-09 | 1556835 |
| 2016-09-12 | 1311996 |
| 2016-09-13 | 1509706 |
| 2016-09-14 | 1000722 |
| 2016-09-15 | 1817671 |
| 2016-09-16 | 2662885 |
| 2016-09-19 | 894390 |
| 2016-09-20 | 749903 |
| 2016-09-21 | 1053473 |
| 2016-09-22 | 838247 |
| 2016-09-23 | 663155 |
| 2016-09-26 | 950154 |
| 2016-09-27 | 675511 |
| 2016-09-28 | 540857 |
| 2016-09-29 | 804324 |
| 2016-09-30 | 1329614 |
| 2016-10-03 | 1008405 |
| 2016-10-04 | 1813808 |
| 2016-10-05 | 2975203 |
| 2016-10-06 | 1406236 |
| 2016-10-07 | 2157756 |
| 2016-10-10 | 1242734 |
| 2016-10-11 | 1598302 |
| 2016-10-12 | 1082127 |
| 2016-10-13 | 919536 |
| 2016-10-14 | 927066 |
| 2016-10-17 | 684291 |
| 2016-10-18 | 766415 |
| 2016-10-19 | 652835 |
| 2016-10-20 | 888343 |
| 2016-10-21 | 933825 |
| 2016-10-24 | 886467 |
| 2016-10-25 | 645569 |
| 2016-10-26 | 850801 |
| 2016-10-27 | 703702 |
| 2016-10-28 | 953017 |
| 2016-10-31 | 847428 |
| 2016-11-01 | 1137638 |
| 2016-11-02 | 924986 |
| 2016-11-03 | 741930 |
| 2016-11-04 | 1129225 |
| 2016-11-07 | 1044935 |
| 2016-11-08 | 969035 |
| 2016-11-09 | 1104843 |
| 2016-11-10 | 1750920 |
| 2016-11-11 | 1643359 |
| 2016-11-14 | 3170042 |
| 2016-11-15 | 3117411 |
| 2016-11-16 | 1912068 |
| 2016-11-17 | 1119458 |
| 2016-11-18 | 1235957 |
| 2016-11-21 | 1126834 |
| 2016-11-22 | 876497 |
| 2016-11-23 | 869081 |
| 2016-11-25 | 227914 |
| 2016-11-28 | 1110746 |
| 2016-11-29 | 1119282 |
| 2016-11-30 | 1452191 |
| 2016-12-01 | 2428714 |
| 2016-12-02 | 1684632 |
| 2016-12-05 | 1686522 |
| 2016-12-06 | 1416560 |
| 2016-12-07 | 1064390 |
| 2016-12-08 | 962318 |
| 2016-12-09 | 1174530 |
| 2016-12-12 | 1095972 |
| 2016-12-13 | 1045738 |
| 2016-12-14 | 1102073 |
| 2016-12-15 | 1085341 |
| 2016-12-16 | 1741857 |
| 2016-12-19 | 958086 |
| 2016-12-20 | 1097579 |
| 2016-12-21 | 931461 |
| 2016-12-22 | 705191 |
| 2016-12-23 | 600927 |
| 2016-12-27 | 496705 |
| 2016-12-28 | 894415 |
| 2016-12-29 | 1022324 |
| 2016-12-30 | 941145 |
| 2017-01-03 | 1640316 |
| 2017-01-04 | 1769728 |
| 2017-01-05 | 1741394 |
| 2017-01-06 | 1581759 |
| 2017-01-09 | 3860222 |
| 2017-01-10 | 2196731 |
| 2017-01-11 | 1330386 |
| 2017-01-12 | 1660258 |
| 2017-01-13 | 1104723 |
| 2017-01-17 | 1204644 |
| 2017-01-18 | 1759755 |
| 2017-01-19 | 2011880 |
| 2017-01-20 | 1443011 |
| 2017-01-23 | 1192616 |
| 2017-01-24 | 953891 |
| 2017-01-25 | 1260327 |
| 2017-01-26 | 1292707 |
| 2017-01-27 | 1222922 |
| 2017-01-30 | 1287628 |
| 2017-01-31 | 790482 |
| 2017-02-01 | 1188644 |
| 2017-02-02 | 1062590 |
| 2017-02-03 | 2023552 |
| 2017-02-06 | 931449 |
| 2017-02-07 | 1376188 |
| 2017-02-08 | 1002529 |
| 2017-02-09 | 1103478 |
| 2017-02-10 | 947608 |
| 2017-02-13 | 767731 |
| 2017-02-14 | 858097 |
| 2017-02-15 | 647138 |
| 2017-02-16 | 821990 |
| 2017-02-17 | 1752237 |
| 2017-02-21 | 903326 |
| 2017-02-22 | 920934 |
| 2017-02-23 | 1291531 |
| 2017-02-24 | 1145785 |
| 2017-02-27 | 1463900 |
| 2017-02-28 | 1982851 |
| 2017-03-01 | 2212690 |
| 2017-03-02 | 1257690 |
| 2017-03-03 | 2220672 |
| 2017-03-06 | 1364222 |
| 2017-03-07 | 1773814 |
| 2017-03-08 | 1165037 |
| 2017-03-09 | 937054 |
| 2017-03-10 | 1306907 |
| 2017-03-13 | 734283 |
| 2017-03-14 | 597419 |
| 2017-03-15 | 1400705 |
| 2017-03-16 | 1018911 |
| 2017-03-17 | 1107413 |
| 2017-03-20 | 867511 |
| 2017-03-21 | 997057 |
| 2017-03-22 | 597743 |
| 2017-03-23 | 1014489 |
| 2017-03-24 | 1567884 |
| 2017-03-27 | 1366311 |
| 2017-03-28 | 1079754 |
| 2017-03-29 | 859119 |
| 2017-03-30 | 2143327 |
| 2017-03-31 | 1357944 |
| 2017-04-03 | 1404429 |
| 2017-04-04 | 1299958 |
| 2017-04-05 | 864396 |
| 2017-04-06 | 687226 |
| 2017-04-07 | 626892 |
| 2017-04-10 | 756557 |
| 2017-04-11 | 926164 |
| 2017-04-12 | 703838 |
| 2017-04-13 | 1064969 |
| 2017-04-17 | 700130 |
| 2017-04-18 | 692829 |
| 2017-04-19 | 832972 |
| 2017-04-20 | 1658138 |
| 2017-04-21 | 1603569 |
| 2017-04-24 | 1172502 |
| 2017-04-25 | 1282817 |
| 2017-04-26 | 923456 |
| 2017-04-27 | 1071233 |
| 2017-04-28 | 1777565 |
| 2017-05-01 | 1107796 |
| 2017-05-02 | 898960 |
| 2017-05-03 | 1891609 |
| 2017-05-04 | 3042133 |
| 2017-05-05 | 1728495 |
| 2017-05-08 | 1155117 |
| 2017-05-09 | 1591358 |
| 2017-05-10 | 1188868 |
| 2017-05-11 | 853088 |
| 2017-05-12 | 935166 |
| 2017-05-15 | 1229970 |
| 2017-05-16 | 986041 |
| 2017-05-17 | 1329618 |
| 2017-05-18 | 1014600 |
| 2017-05-19 | 1006465 |
| 2017-05-22 | 926924 |
| 2017-05-23 | 1477936 |
| 2017-05-24 | 1038138 |
| 2017-05-25 | 1062052 |
| 2017-05-26 | 1068672 |
| 2017-05-30 | 845145 |
| 2017-05-31 | 1419529 |
| 2017-06-01 | 1252435 |
| 2017-06-02 | 1227091 |
| 2017-06-05 | 1529372 |
| 2017-06-06 | 1171016 |
| 2017-06-07 | 859924 |
| 2017-06-08 | 1056400 |
| 2017-06-09 | 1719679 |
| 2017-06-12 | 1392383 |
| 2017-06-13 | 926448 |
| 2017-06-14 | 698618 |
| 2017-06-15 | 839791 |
| 2017-06-16 | 1159186 |
| 2017-06-19 | 679516 |
| 2017-06-20 | 616727 |
| 2017-06-21 | 862818 |
| 2017-06-22 | 914857 |
| 2017-06-23 | 1175950 |
| 2017-06-26 | 515220 |
| 2017-06-27 | 793109 |
| 2017-06-28 | 1066161 |
| 2017-06-29 | 971553 |
| 2017-06-30 | 665163 |
| 2017-07-03 | 476459 |
| 2017-07-05 | 947245 |
| 2017-07-06 | 963428 |
| 2017-07-07 | 864656 |
| 2017-07-10 | 1331041 |
| 2017-07-11 | 1173137 |
| 2017-07-12 | 748235 |
| 2017-07-13 | 727160 |
| 2017-07-14 | 840765 |
| 2017-07-17 | 1427874 |
| 2017-07-18 | 870365 |
| 2017-07-19 | 933708 |
| 2017-07-20 | 1166038 |
| 2017-07-21 | 894026 |
| 2017-07-24 | 766930 |
| 2017-07-25 | 836992 |
| 2017-07-26 | 662799 |
| 2017-07-27 | 861908 |
| 2017-07-28 | 600059 |
| 2017-07-31 | 798575 |
| 2017-08-01 | 1007935 |
| 2017-08-02 | 1298914 |
| 2017-08-03 | 2136436 |
| 2017-08-04 | 2128728 |
| 2017-08-07 | 2060242 |
| 2017-08-08 | 1130320 |
| 2017-08-09 | 1482369 |
| 2017-08-10 | 1305551 |
| 2017-08-11 | 930324 |
| 2017-08-14 | 922348 |
| 2017-08-15 | 787302 |
| 2017-08-16 | 789161 |
| 2017-08-17 | 606826 |
| 2017-08-18 | 773087 |
| 2017-08-21 | 857678 |
| 2017-08-22 | 583912 |
| 2017-08-23 | 659621 |
| 2017-08-24 | 464316 |
| 2017-08-25 | 669249 |
| 2017-08-28 | 562869 |
| 2017-08-29 | 493388 |
| 2017-08-30 | 565803 |
| 2017-08-31 | 692465 |
| 2017-09-01 | 390113 |
| 2017-09-05 | 655382 |
| 2017-09-06 | 631520 |
| 2017-09-07 | 649364 |
| 2017-09-08 | 1047840 |
| 2017-09-11 | 924407 |
| 2017-09-12 | 1176140 |
| 2017-09-13 | 887300 |
| 2017-09-14 | 1089167 |
| 2017-09-15 | 1334096 |
| 2017-09-18 | 1108025 |
| 2017-09-19 | 842213 |
| 2017-09-20 | 1056303 |
| 2017-09-21 | 683542 |
| 2017-09-22 | 810317 |
| 2017-09-25 | 1572028 |
| 2017-09-26 | 1334762 |
| 2017-09-27 | 1208896 |
| 2017-09-28 | 1179306 |
| 2017-09-29 | 835678 |
| 2017-10-02 | 1054105 |
| 2017-10-03 | 1133363 |
| 2017-10-04 | 1015295 |
| 2017-10-05 | 779260 |
| 2017-10-06 | 629537 |
| 2017-10-09 | 865965 |
| 2017-10-10 | 1622526 |
| 2017-10-11 | 1030071 |
| 2017-10-12 | 723497 |
| 2017-10-13 | 579472 |
| 2017-10-16 | 727412 |
| 2017-10-17 | 901954 |
| 2017-10-18 | 968274 |
| 2017-10-19 | 923083 |
| 2017-10-20 | 928116 |
| 2017-10-23 | 1236378 |
| 2017-10-24 | 549126 |
| 2017-10-25 | 915108 |
| 2017-10-26 | 1796716 |
| 2017-10-27 | 1116324 |
| 2017-10-30 | 738101 |
| 2017-10-31 | 1720292 |
| 2017-11-01 | 1055552 |
| 2017-11-02 | 687774 |
| 2017-11-03 | 1103218 |
| 2017-11-06 | 1097516 |
| 2017-11-07 | 1253047 |
| 2017-11-08 | 2263410 |
| 2017-11-09 | 1781758 |
| 2017-11-10 | 1142860 |
| 2017-11-13 | 1367074 |
| 2017-11-14 | 1072172 |
| 2017-11-15 | 1131869 |
| 2017-11-16 | 862589 |
| 2017-11-17 | 623234 |
| 2017-11-20 | 696054 |
| 2017-11-21 | 1017435 |
| 2017-11-22 | 659497 |
| 2017-11-24 | 266019 |
| 2017-11-27 | 686347 |
| 2017-11-28 | 838236 |
| 2017-11-29 | 1837349 |
| 2017-11-30 | 1725694 |
| 2017-12-01 | 1093707 |
| 2017-12-04 | 2119253 |
| 2017-12-05 | 1328567 |
| 2017-12-06 | 1630742 |
| 2017-12-07 | 709782 |
| 2017-12-08 | 639007 |
| 2017-12-11 | 866231 |
| 2017-12-12 | 892820 |
| 2017-12-13 | 1049833 |
| 2017-12-14 | 1269885 |
| 2017-12-15 | 2747251 |
| 2017-12-18 | 1003716 |
| 2017-12-19 | 1218007 |
| 2017-12-20 | 734217 |
| 2017-12-21 | 1119040 |
| 2017-12-22 | 548734 |
| 2017-12-26 | 440802 |
| 2017-12-27 | 1077759 |
| 2017-12-28 | 948161 |
| 2017-12-29 | 844418 |
| 2018-01-02 | 1150420 |
| 2018-01-03 | 1221598 |
| 2018-01-04 | 1121874 |
| 2018-01-05 | 1001729 |
| 2018-01-08 | 577055 |
| 2018-01-09 | 1353435 |
| 2018-01-10 | 1222986 |
| 2018-01-11 | 658275 |
| 2018-01-12 | 843457 |
| 2018-01-16 | 1553288 |
| 2018-01-17 | 804918 |
| 2018-01-18 | 642029 |
| 2018-01-19 | 1077177 |
| 2018-01-22 | 875418 |
| 2018-01-23 | 1216075 |
| 2018-01-24 | 1325386 |
| 2018-01-25 | 846320 |
| 2018-01-26 | 682045 |
| 2018-01-29 | 792499 |
| 2018-01-30 | 717440 |
| 2018-01-31 | 941578 |
| 2018-02-01 | 964985 |
| 2018-02-02 | 1053201 |
| 2018-02-05 | 1013183 |
| 2018-02-06 | 1256877 |
| 2018-02-07 | 770089 |
| 2018-02-08 | 1454498 |
| 2018-02-09 | 1575669 |
| 2018-02-12 | 1900242 |
| 2018-02-13 | 1248813 |
| 2018-02-14 | 1503777 |
| 2018-02-15 | 2883485 |
| 2018-02-16 | 1686790 |
| 2018-02-20 | 1343004 |
| 2018-02-21 | 870872 |
| 2018-02-22 | 960842 |
| 2018-02-23 | 1061841 |
| 2018-02-26 | 831714 |
| 2018-02-27 | 1964035 |
| 2018-02-28 | 1756322 |
| 2018-03-01 | 1594826 |
| 2018-03-02 | 1440874 |
| 2018-03-05 | 1550058 |
| 2018-03-06 | 879843 |
| 2018-03-07 | 602909 |
| 2018-03-08 | 578283 |
| 2018-03-09 | 658184 |
| 2018-03-12 | 769251 |
| 2018-03-13 | 1130220 |
| 2018-03-14 | 892329 |
| 2018-03-15 | 729853 |
| 2018-03-16 | 1227454 |
| 2018-03-19 | 990248 |
| 2018-03-20 | 742751 |
| 2018-03-21 | 699428 |
| 2018-03-22 | 810564 |
| 2018-03-23 | 736689 |
| 2018-03-26 | 799937 |
| 2018-03-27 | 756993 |
| 2018-03-28 | 1086883 |
| 2018-03-29 | 1029270 |
| 2018-04-02 | 1110332 |
| 2018-04-03 | 1338779 |
| 2018-04-04 | 1045786 |
| 2018-04-05 | 824160 |
| 2018-04-06 | 844764 |
| 2018-04-09 | 946783 |
| 2018-04-10 | 1434853 |
| 2018-04-11 | 1208095 |
| 2018-04-12 | 1076936 |
| 2018-04-13 | 1095980 |
| 2018-04-16 | 702160 |
| 2018-04-17 | 797609 |
| 2018-04-18 | 765055 |
| 2018-04-19 | 554320 |
| 2018-04-20 | 673295 |
| 2018-04-23 | 453536 |
| 2018-04-24 | 930728 |
| 2018-04-25 | 746558 |
| 2018-04-26 | 853449 |
| 2018-04-27 | 925347 |
| 2018-04-30 | 1357903 |
| 2018-05-01 | 863259 |
| 2018-05-02 | 1680837 |
| 2018-05-03 | 1776844 |
| 2018-05-04 | 1042665 |
| 2018-05-07 | 1457289 |
| 2018-05-08 | 1048771 |
| 2018-05-09 | 695228 |
| 2018-05-10 | 780604 |
| 2018-05-11 | 732071 |
| 2018-05-14 | 788670 |
| 2018-05-15 | 694300 |
| 2018-05-16 | 802898 |
| 2018-05-17 | 919496 |
| 2018-05-18 | 1113697 |
| 2018-05-21 | 1117422 |
| 2018-05-22 | 1287305 |
| 2018-05-23 | 1422604 |
| 2018-05-24 | 1243059 |
| 2018-05-25 | 1065097 |
| 2018-05-29 | 1301334 |
| 2018-05-30 | 1111369 |
| 2018-05-31 | 936373 |
| 2018-06-01 | 1182603 |
| 2018-06-04 | 1079491 |
| 2018-06-05 | 1252783 |
| 2018-06-06 | 1032939 |
| 2018-06-07 | 1083197 |
| 2018-06-08 | 988322 |
| 2018-06-11 | 655305 |
| 2018-06-12 | 887926 |
| 2018-06-13 | 765982 |
| 2018-06-14 | 971494 |
| 2018-06-15 | 1191726 |
| 2018-06-18 | 1133594 |
| 2018-06-19 | 1010972 |
| 2018-06-20 | 946935 |
| 2018-06-21 | 951600 |
| 2018-06-22 | 1202087 |
| 2018-06-25 | 938491 |
| 2018-06-26 | 1120085 |
| 2018-06-27 | 1241309 |
| 2018-06-28 | 1430592 |
| 2018-06-29 | 1213479 |
| 2018-07-02 | 967052 |
| 2018-07-03 | 466986 |
| 2018-07-05 | 882502 |
| 2018-07-06 | 757655 |
| 2018-07-09 | 864504 |
| 2018-07-10 | 768467 |
| 2018-07-11 | 1692476 |
| 2018-07-12 | 1079782 |
| 2018-07-13 | 704675 |
| 2018-07-16 | 648819 |
| 2018-07-17 | 626773 |
| 2018-07-18 | 647131 |
| 2018-07-19 | 659101 |
| 2018-07-20 | 771931 |
| 2018-07-23 | 467479 |
| 2018-07-24 | 2082230 |
| 2018-07-25 | 910691 |
| 2018-07-26 | 735206 |
| 2018-07-27 | 594578 |
| 2018-07-30 | 768902 |
| 2018-07-31 | 941462 |
| 2018-08-01 | 1776497 |
| 2018-08-02 | 3271533 |
| 2018-08-03 | 1503221 |
| 2018-08-06 | 1225146 |
| 2018-08-07 | 989983 |
| 2018-08-08 | 1343293 |
| 2018-08-09 | 1159536 |
| 2018-08-10 | 864360 |
| 2018-08-13 | 1072494 |
| 2018-08-14 | 713808 |
| 2018-08-15 | 974538 |
| 2018-08-16 | 815450 |
| 2018-08-17 | 688690 |
| 2018-08-20 | 637003 |
| 2018-08-21 | 621788 |
| 2018-08-22 | 520529 |
| 2018-08-23 | 512783 |
| 2018-08-24 | 534886 |
| 2018-08-27 | 962260 |
| 2018-08-28 | 1042943 |
| 2018-08-29 | 709771 |
| 2018-08-30 | 999097 |
| 2018-08-31 | 907319 |
| 2018-09-04 | 758570 |
| 2018-09-05 | 1053173 |
| 2018-09-06 | 675585 |
| 2018-09-07 | 981057 |
| 2018-09-10 | 831553 |
| 2018-09-11 | 794499 |
| 2018-09-12 | 882709 |
| 2018-09-13 | 765944 |
| 2018-09-14 | 429182 |
| 2018-09-17 | 433068 |
| 2018-09-18 | 693306 |
| 2018-09-19 | 825219 |
| 2018-09-20 | 922815 |
| 2018-09-21 | 1514120 |
| 2018-09-24 | 562425 |
| 2018-09-25 | 702275 |
| 2018-09-26 | 943797 |
| 2018-09-27 | 780176 |
| 2018-09-28 | 2869878 |
| 2018-10-01 | 1714854 |
| 2018-10-02 | 1106204 |
| 2018-10-03 | 894795 |
| 2018-10-04 | 1180933 |
| 2018-10-05 | 1331696 |
| 2018-10-08 | 1483771 |
| 2018-10-09 | 928339 |
| 2018-10-10 | 1639953 |
| 2018-10-11 | 2391291 |
| 2018-10-12 | 2077699 |
| 2018-10-15 | 1518247 |
| 2018-10-16 | 1395990 |
| 2018-10-17 | 728728 |
| 2018-10-18 | 990639 |
| 2018-10-19 | 962682 |
| 2018-10-22 | 1140206 |
| 2018-10-23 | 1154545 |
| 2018-10-24 | 1103555 |
| 2018-10-25 | 1919148 |
| 2018-10-26 | 1238236 |
| 2018-10-29 | 2580694 |
| 2018-10-30 | 2416044 |
| 2018-10-31 | 1811043 |
| 2018-11-01 | 1160244 |
| 2018-11-02 | 999601 |
| 2018-11-05 | 1250045 |
| 2018-11-06 | 954947 |
| 2018-11-07 | 968677 |
| 2018-11-08 | 662011 |
| 2018-11-09 | 1063988 |
| 2018-11-12 | 1091748 |
| 2018-11-13 | 1278081 |
| 2018-11-14 | 1112297 |
| 2018-11-15 | 1319608 |
| 2018-11-16 | 1080210 |
| 2018-11-19 | 2276711 |
| 2018-11-20 | 2052161 |
| 2018-11-21 | 1030754 |
| 2018-11-23 | 387261 |
| 2018-11-26 | 1096044 |
| 2018-11-27 | 850780 |
| 2018-11-28 | 1355296 |
| 2018-11-29 | 1218279 |
| 2018-11-30 | 1391521 |
| 2018-12-03 | 1560574 |
| 2018-12-04 | 1382773 |
| 2018-12-06 | 2120130 |
| 2018-12-07 | 1143965 |
| 2018-12-10 | 1085100 |
| 2018-12-11 | 712432 |
| 2018-12-12 | 995265 |
| 2018-12-13 | 887397 |
| 2018-12-14 | 828196 |
| 2018-12-17 | 1637983 |
| 2018-12-18 | 1589020 |
| 2018-12-19 | 2519350 |
| 2018-12-20 | 1781265 |
| 2018-12-21 | 2318182 |
| 2018-12-24 | 619773 |
| 2018-12-26 | 1419544 |
| 2018-12-27 | 1192560 |
| 2018-12-28 | 1476405 |
| 2018-12-31 | 870284 |
| 2019-01-02 | 1569940 |
| 2019-01-03 | 1086248 |
| 2019-01-04 | 1629939 |
| 2019-01-07 | 1728252 |
| 2019-01-08 | 1670235 |
| 2019-01-09 | 1010568 |
| 2019-01-10 | 1291162 |
| 2019-01-11 | 1334461 |
| 2019-01-14 | 1677989 |
| 2019-01-15 | 1423973 |
| 2019-01-16 | 1623058 |
| 2019-01-17 | 864650 |
| 2019-01-18 | 1521194 |
| 2019-01-22 | 1662991 |
| 2019-01-23 | 2972762 |
| 2019-01-24 | 1305751 |
| 2019-01-25 | 1837474 |
| 2019-01-28 | 1101658 |
| 2019-01-29 | 923113 |
| 2019-01-30 | 1358416 |
| 2019-01-31 | 1719613 |
| 2019-02-01 | 1623660 |
| 2019-02-04 | 1079088 |
| 2019-02-05 | 1565498 |
| 2019-02-06 | 1541264 |
| 2019-02-07 | 1925920 |
| 2019-02-08 | 1181104 |
| 2019-02-11 | 1631657 |
| 2019-02-12 | 1685740 |
| 2019-02-13 | 2699444 |
| 2019-02-14 | 1507136 |
| 2019-02-15 | 1510225 |
| 2019-02-19 | 1102330 |
| 2019-02-20 | 1741452 |
| 2019-02-21 | 1403057 |
| 2019-02-22 | 710066 |
| 2019-02-25 | 1056599 |
| 2019-02-26 | 1054780 |
| 2019-02-27 | 855579 |
| 2019-02-28 | 1352565 |
| 2019-03-01 | 782307 |
| 2019-03-04 | 1265088 |
| 2019-03-05 | 1043555 |
| 2019-03-06 | 959211 |
| 2019-03-07 | 1732188 |
| 2019-03-08 | 1078518 |
| 2019-03-11 | 843422 |
| 2019-03-12 | 973915 |
| 2019-03-13 | 1198734 |
| 2019-03-14 | 1005157 |
| 2019-03-15 | 1232087 |
| 2019-03-18 | 1134445 |
| 2019-03-19 | 1025939 |
| 2019-03-20 | 1224309 |
| 2019-03-21 | 665638 |
| 2019-03-22 | 699450 |